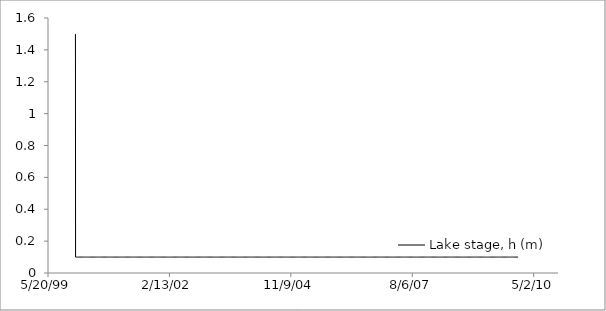
| Category | Lake stage, h (m) |
|---|---|
| 36526.0 | 1.5 |
| 36527.0 | 0.1 |
| 36528.0 | 0.1 |
| 36529.0 | 0.1 |
| 36530.0 | 0.1 |
| 36531.0 | 0.1 |
| 36532.0 | 0.1 |
| 36533.0 | 0.1 |
| 36534.0 | 0.1 |
| 36535.0 | 0.1 |
| 36536.0 | 0.1 |
| 36537.0 | 0.1 |
| 36538.0 | 0.1 |
| 36539.0 | 0.1 |
| 36540.0 | 0.1 |
| 36541.0 | 0.1 |
| 36542.0 | 0.1 |
| 36543.0 | 0.1 |
| 36544.0 | 0.1 |
| 36545.0 | 0.1 |
| 36546.0 | 0.1 |
| 36547.0 | 0.1 |
| 36548.0 | 0.1 |
| 36549.0 | 0.1 |
| 36550.0 | 0.1 |
| 36551.0 | 0.1 |
| 36552.0 | 0.1 |
| 36553.0 | 0.1 |
| 36554.0 | 0.1 |
| 36555.0 | 0.1 |
| 36556.0 | 0.1 |
| 36557.0 | 0.1 |
| 36558.0 | 0.1 |
| 36559.0 | 0.1 |
| 36560.0 | 0.1 |
| 36561.0 | 0.1 |
| 36562.0 | 0.1 |
| 36563.0 | 0.1 |
| 36564.0 | 0.1 |
| 36565.0 | 0.1 |
| 36566.0 | 0.1 |
| 36567.0 | 0.1 |
| 36568.0 | 0.1 |
| 36569.0 | 0.1 |
| 36570.0 | 0.1 |
| 36571.0 | 0.1 |
| 36572.0 | 0.1 |
| 36573.0 | 0.1 |
| 36574.0 | 0.1 |
| 36575.0 | 0.1 |
| 36576.0 | 0.1 |
| 36577.0 | 0.1 |
| 36578.0 | 0.1 |
| 36579.0 | 0.1 |
| 36580.0 | 0.1 |
| 36581.0 | 0.1 |
| 36582.0 | 0.1 |
| 36583.0 | 0.1 |
| 36584.0 | 0.1 |
| 36585.0 | 0.1 |
| 36586.0 | 0.1 |
| 36587.0 | 0.1 |
| 36588.0 | 0.1 |
| 36589.0 | 0.1 |
| 36590.0 | 0.1 |
| 36591.0 | 0.1 |
| 36592.0 | 0.1 |
| 36593.0 | 0.1 |
| 36594.0 | 0.1 |
| 36595.0 | 0.1 |
| 36596.0 | 0.1 |
| 36597.0 | 0.1 |
| 36598.0 | 0.1 |
| 36599.0 | 0.1 |
| 36600.0 | 0.1 |
| 36601.0 | 0.1 |
| 36602.0 | 0.1 |
| 36603.0 | 0.1 |
| 36604.0 | 0.1 |
| 36605.0 | 0.1 |
| 36606.0 | 0.1 |
| 36607.0 | 0.1 |
| 36608.0 | 0.1 |
| 36609.0 | 0.1 |
| 36610.0 | 0.1 |
| 36611.0 | 0.1 |
| 36612.0 | 0.1 |
| 36613.0 | 0.1 |
| 36614.0 | 0.1 |
| 36615.0 | 0.1 |
| 36616.0 | 0.1 |
| 36617.0 | 0.1 |
| 36618.0 | 0.1 |
| 36619.0 | 0.1 |
| 36620.0 | 0.1 |
| 36621.0 | 0.1 |
| 36622.0 | 0.1 |
| 36623.0 | 0.1 |
| 36624.0 | 0.1 |
| 36625.0 | 0.1 |
| 36626.0 | 0.1 |
| 36627.0 | 0.1 |
| 36628.0 | 0.1 |
| 36629.0 | 0.1 |
| 36630.0 | 0.1 |
| 36631.0 | 0.1 |
| 36632.0 | 0.1 |
| 36633.0 | 0.1 |
| 36634.0 | 0.1 |
| 36635.0 | 0.1 |
| 36636.0 | 0.1 |
| 36637.0 | 0.1 |
| 36638.0 | 0.1 |
| 36639.0 | 0.1 |
| 36640.0 | 0.1 |
| 36641.0 | 0.1 |
| 36642.0 | 0.1 |
| 36643.0 | 0.1 |
| 36644.0 | 0.1 |
| 36645.0 | 0.1 |
| 36646.0 | 0.1 |
| 36647.0 | 0.1 |
| 36648.0 | 0.1 |
| 36649.0 | 0.1 |
| 36650.0 | 0.1 |
| 36651.0 | 0.1 |
| 36652.0 | 0.1 |
| 36653.0 | 0.1 |
| 36654.0 | 0.1 |
| 36655.0 | 0.1 |
| 36656.0 | 0.1 |
| 36657.0 | 0.1 |
| 36658.0 | 0.1 |
| 36659.0 | 0.1 |
| 36660.0 | 0.1 |
| 36661.0 | 0.1 |
| 36662.0 | 0.1 |
| 36663.0 | 0.1 |
| 36664.0 | 0.1 |
| 36665.0 | 0.1 |
| 36666.0 | 0.1 |
| 36667.0 | 0.1 |
| 36668.0 | 0.1 |
| 36669.0 | 0.1 |
| 36670.0 | 0.1 |
| 36671.0 | 0.1 |
| 36672.0 | 0.1 |
| 36673.0 | 0.1 |
| 36674.0 | 0.1 |
| 36675.0 | 0.1 |
| 36676.0 | 0.1 |
| 36677.0 | 0.1 |
| 36678.0 | 0.1 |
| 36679.0 | 0.1 |
| 36680.0 | 0.1 |
| 36681.0 | 0.1 |
| 36682.0 | 0.1 |
| 36683.0 | 0.1 |
| 36684.0 | 0.1 |
| 36685.0 | 0.1 |
| 36686.0 | 0.1 |
| 36687.0 | 0.1 |
| 36688.0 | 0.1 |
| 36689.0 | 0.1 |
| 36690.0 | 0.1 |
| 36691.0 | 0.1 |
| 36692.0 | 0.1 |
| 36693.0 | 0.1 |
| 36694.0 | 0.1 |
| 36695.0 | 0.1 |
| 36696.0 | 0.1 |
| 36697.0 | 0.1 |
| 36698.0 | 0.1 |
| 36699.0 | 0.1 |
| 36700.0 | 0.1 |
| 36701.0 | 0.1 |
| 36702.0 | 0.1 |
| 36703.0 | 0.1 |
| 36704.0 | 0.1 |
| 36705.0 | 0.1 |
| 36706.0 | 0.1 |
| 36707.0 | 0.1 |
| 36708.0 | 0.1 |
| 36709.0 | 0.1 |
| 36710.0 | 0.1 |
| 36711.0 | 0.1 |
| 36712.0 | 0.1 |
| 36713.0 | 0.1 |
| 36714.0 | 0.1 |
| 36715.0 | 0.1 |
| 36716.0 | 0.1 |
| 36717.0 | 0.1 |
| 36718.0 | 0.1 |
| 36719.0 | 0.1 |
| 36720.0 | 0.1 |
| 36721.0 | 0.1 |
| 36722.0 | 0.1 |
| 36723.0 | 0.1 |
| 36724.0 | 0.1 |
| 36725.0 | 0.1 |
| 36726.0 | 0.1 |
| 36727.0 | 0.1 |
| 36728.0 | 0.1 |
| 36729.0 | 0.1 |
| 36730.0 | 0.1 |
| 36731.0 | 0.1 |
| 36732.0 | 0.1 |
| 36733.0 | 0.1 |
| 36734.0 | 0.1 |
| 36735.0 | 0.1 |
| 36736.0 | 0.1 |
| 36737.0 | 0.1 |
| 36738.0 | 0.1 |
| 36739.0 | 0.1 |
| 36740.0 | 0.1 |
| 36741.0 | 0.1 |
| 36742.0 | 0.1 |
| 36743.0 | 0.1 |
| 36744.0 | 0.1 |
| 36745.0 | 0.1 |
| 36746.0 | 0.1 |
| 36747.0 | 0.1 |
| 36748.0 | 0.1 |
| 36749.0 | 0.1 |
| 36750.0 | 0.1 |
| 36751.0 | 0.1 |
| 36752.0 | 0.1 |
| 36753.0 | 0.1 |
| 36754.0 | 0.1 |
| 36755.0 | 0.1 |
| 36756.0 | 0.1 |
| 36757.0 | 0.1 |
| 36758.0 | 0.1 |
| 36759.0 | 0.1 |
| 36760.0 | 0.1 |
| 36761.0 | 0.1 |
| 36762.0 | 0.1 |
| 36763.0 | 0.1 |
| 36764.0 | 0.1 |
| 36765.0 | 0.1 |
| 36766.0 | 0.1 |
| 36767.0 | 0.1 |
| 36768.0 | 0.1 |
| 36769.0 | 0.1 |
| 36770.0 | 0.1 |
| 36771.0 | 0.1 |
| 36772.0 | 0.1 |
| 36773.0 | 0.1 |
| 36774.0 | 0.1 |
| 36775.0 | 0.1 |
| 36776.0 | 0.1 |
| 36777.0 | 0.1 |
| 36778.0 | 0.1 |
| 36779.0 | 0.1 |
| 36780.0 | 0.1 |
| 36781.0 | 0.1 |
| 36782.0 | 0.1 |
| 36783.0 | 0.1 |
| 36784.0 | 0.1 |
| 36785.0 | 0.1 |
| 36786.0 | 0.1 |
| 36787.0 | 0.1 |
| 36788.0 | 0.1 |
| 36789.0 | 0.1 |
| 36790.0 | 0.1 |
| 36791.0 | 0.1 |
| 36792.0 | 0.1 |
| 36793.0 | 0.1 |
| 36794.0 | 0.1 |
| 36795.0 | 0.1 |
| 36796.0 | 0.1 |
| 36797.0 | 0.1 |
| 36798.0 | 0.1 |
| 36799.0 | 0.1 |
| 36800.0 | 0.1 |
| 36801.0 | 0.1 |
| 36802.0 | 0.1 |
| 36803.0 | 0.1 |
| 36804.0 | 0.1 |
| 36805.0 | 0.1 |
| 36806.0 | 0.1 |
| 36807.0 | 0.1 |
| 36808.0 | 0.1 |
| 36809.0 | 0.1 |
| 36810.0 | 0.1 |
| 36811.0 | 0.1 |
| 36812.0 | 0.1 |
| 36813.0 | 0.1 |
| 36814.0 | 0.1 |
| 36815.0 | 0.1 |
| 36816.0 | 0.1 |
| 36817.0 | 0.1 |
| 36818.0 | 0.1 |
| 36819.0 | 0.1 |
| 36820.0 | 0.1 |
| 36821.0 | 0.1 |
| 36822.0 | 0.1 |
| 36823.0 | 0.1 |
| 36824.0 | 0.1 |
| 36825.0 | 0.1 |
| 36826.0 | 0.1 |
| 36827.0 | 0.1 |
| 36828.0 | 0.1 |
| 36829.0 | 0.1 |
| 36830.0 | 0.1 |
| 36831.0 | 0.1 |
| 36832.0 | 0.1 |
| 36833.0 | 0.1 |
| 36834.0 | 0.1 |
| 36835.0 | 0.1 |
| 36836.0 | 0.1 |
| 36837.0 | 0.1 |
| 36838.0 | 0.1 |
| 36839.0 | 0.1 |
| 36840.0 | 0.1 |
| 36841.0 | 0.1 |
| 36842.0 | 0.1 |
| 36843.0 | 0.1 |
| 36844.0 | 0.1 |
| 36845.0 | 0.1 |
| 36846.0 | 0.1 |
| 36847.0 | 0.1 |
| 36848.0 | 0.1 |
| 36849.0 | 0.1 |
| 36850.0 | 0.1 |
| 36851.0 | 0.1 |
| 36852.0 | 0.1 |
| 36853.0 | 0.1 |
| 36854.0 | 0.1 |
| 36855.0 | 0.1 |
| 36856.0 | 0.1 |
| 36857.0 | 0.1 |
| 36858.0 | 0.1 |
| 36859.0 | 0.1 |
| 36860.0 | 0.1 |
| 36861.0 | 0.1 |
| 36862.0 | 0.1 |
| 36863.0 | 0.1 |
| 36864.0 | 0.1 |
| 36865.0 | 0.1 |
| 36866.0 | 0.1 |
| 36867.0 | 0.1 |
| 36868.0 | 0.1 |
| 36869.0 | 0.1 |
| 36870.0 | 0.1 |
| 36871.0 | 0.1 |
| 36872.0 | 0.1 |
| 36873.0 | 0.1 |
| 36874.0 | 0.1 |
| 36875.0 | 0.1 |
| 36876.0 | 0.1 |
| 36877.0 | 0.1 |
| 36878.0 | 0.1 |
| 36879.0 | 0.1 |
| 36880.0 | 0.1 |
| 36881.0 | 0.1 |
| 36882.0 | 0.1 |
| 36883.0 | 0.1 |
| 36884.0 | 0.1 |
| 36885.0 | 0.1 |
| 36886.0 | 0.1 |
| 36887.0 | 0.1 |
| 36888.0 | 0.1 |
| 36889.0 | 0.1 |
| 36890.0 | 0.1 |
| 36891.0 | 0.1 |
| 36892.0 | 0.1 |
| 36893.0 | 0.1 |
| 36894.0 | 0.1 |
| 36895.0 | 0.1 |
| 36896.0 | 0.1 |
| 36897.0 | 0.1 |
| 36898.0 | 0.1 |
| 36899.0 | 0.1 |
| 36900.0 | 0.1 |
| 36901.0 | 0.1 |
| 36902.0 | 0.1 |
| 36903.0 | 0.1 |
| 36904.0 | 0.1 |
| 36905.0 | 0.1 |
| 36906.0 | 0.1 |
| 36907.0 | 0.1 |
| 36908.0 | 0.1 |
| 36909.0 | 0.1 |
| 36910.0 | 0.1 |
| 36911.0 | 0.1 |
| 36912.0 | 0.1 |
| 36913.0 | 0.1 |
| 36914.0 | 0.1 |
| 36915.0 | 0.1 |
| 36916.0 | 0.1 |
| 36917.0 | 0.1 |
| 36918.0 | 0.1 |
| 36919.0 | 0.1 |
| 36920.0 | 0.1 |
| 36921.0 | 0.1 |
| 36922.0 | 0.1 |
| 36923.0 | 0.1 |
| 36924.0 | 0.1 |
| 36925.0 | 0.1 |
| 36926.0 | 0.1 |
| 36927.0 | 0.1 |
| 36928.0 | 0.1 |
| 36929.0 | 0.1 |
| 36930.0 | 0.1 |
| 36931.0 | 0.1 |
| 36932.0 | 0.1 |
| 36933.0 | 0.1 |
| 36934.0 | 0.1 |
| 36935.0 | 0.1 |
| 36936.0 | 0.1 |
| 36937.0 | 0.1 |
| 36938.0 | 0.1 |
| 36939.0 | 0.1 |
| 36940.0 | 0.1 |
| 36941.0 | 0.1 |
| 36942.0 | 0.1 |
| 36943.0 | 0.1 |
| 36944.0 | 0.1 |
| 36945.0 | 0.1 |
| 36946.0 | 0.1 |
| 36947.0 | 0.1 |
| 36948.0 | 0.1 |
| 36949.0 | 0.1 |
| 36950.0 | 0.1 |
| 36951.0 | 0.1 |
| 36952.0 | 0.1 |
| 36953.0 | 0.1 |
| 36954.0 | 0.1 |
| 36955.0 | 0.1 |
| 36956.0 | 0.1 |
| 36957.0 | 0.1 |
| 36958.0 | 0.1 |
| 36959.0 | 0.1 |
| 36960.0 | 0.1 |
| 36961.0 | 0.1 |
| 36962.0 | 0.1 |
| 36963.0 | 0.1 |
| 36964.0 | 0.1 |
| 36965.0 | 0.1 |
| 36966.0 | 0.1 |
| 36967.0 | 0.1 |
| 36968.0 | 0.1 |
| 36969.0 | 0.1 |
| 36970.0 | 0.1 |
| 36971.0 | 0.1 |
| 36972.0 | 0.1 |
| 36973.0 | 0.1 |
| 36974.0 | 0.1 |
| 36975.0 | 0.1 |
| 36976.0 | 0.1 |
| 36977.0 | 0.1 |
| 36978.0 | 0.1 |
| 36979.0 | 0.1 |
| 36980.0 | 0.1 |
| 36981.0 | 0.1 |
| 36982.0 | 0.1 |
| 36983.0 | 0.1 |
| 36984.0 | 0.1 |
| 36985.0 | 0.1 |
| 36986.0 | 0.1 |
| 36987.0 | 0.1 |
| 36988.0 | 0.1 |
| 36989.0 | 0.1 |
| 36990.0 | 0.1 |
| 36991.0 | 0.1 |
| 36992.0 | 0.1 |
| 36993.0 | 0.1 |
| 36994.0 | 0.1 |
| 36995.0 | 0.1 |
| 36996.0 | 0.1 |
| 36997.0 | 0.1 |
| 36998.0 | 0.1 |
| 36999.0 | 0.1 |
| 37000.0 | 0.1 |
| 37001.0 | 0.1 |
| 37002.0 | 0.1 |
| 37003.0 | 0.1 |
| 37004.0 | 0.1 |
| 37005.0 | 0.1 |
| 37006.0 | 0.1 |
| 37007.0 | 0.1 |
| 37008.0 | 0.1 |
| 37009.0 | 0.1 |
| 37010.0 | 0.1 |
| 37011.0 | 0.1 |
| 37012.0 | 0.1 |
| 37013.0 | 0.1 |
| 37014.0 | 0.1 |
| 37015.0 | 0.1 |
| 37016.0 | 0.1 |
| 37017.0 | 0.1 |
| 37018.0 | 0.1 |
| 37019.0 | 0.1 |
| 37020.0 | 0.1 |
| 37021.0 | 0.1 |
| 37022.0 | 0.1 |
| 37023.0 | 0.1 |
| 37024.0 | 0.1 |
| 37025.0 | 0.1 |
| 37026.0 | 0.1 |
| 37027.0 | 0.1 |
| 37028.0 | 0.1 |
| 37029.0 | 0.1 |
| 37030.0 | 0.1 |
| 37031.0 | 0.1 |
| 37032.0 | 0.1 |
| 37033.0 | 0.1 |
| 37034.0 | 0.1 |
| 37035.0 | 0.1 |
| 37036.0 | 0.1 |
| 37037.0 | 0.1 |
| 37038.0 | 0.1 |
| 37039.0 | 0.1 |
| 37040.0 | 0.1 |
| 37041.0 | 0.1 |
| 37042.0 | 0.1 |
| 37043.0 | 0.1 |
| 37044.0 | 0.1 |
| 37045.0 | 0.1 |
| 37046.0 | 0.1 |
| 37047.0 | 0.1 |
| 37048.0 | 0.1 |
| 37049.0 | 0.1 |
| 37050.0 | 0.1 |
| 37051.0 | 0.1 |
| 37052.0 | 0.1 |
| 37053.0 | 0.1 |
| 37054.0 | 0.1 |
| 37055.0 | 0.1 |
| 37056.0 | 0.1 |
| 37057.0 | 0.1 |
| 37058.0 | 0.1 |
| 37059.0 | 0.1 |
| 37060.0 | 0.1 |
| 37061.0 | 0.1 |
| 37062.0 | 0.1 |
| 37063.0 | 0.1 |
| 37064.0 | 0.1 |
| 37065.0 | 0.1 |
| 37066.0 | 0.1 |
| 37067.0 | 0.1 |
| 37068.0 | 0.1 |
| 37069.0 | 0.1 |
| 37070.0 | 0.1 |
| 37071.0 | 0.1 |
| 37072.0 | 0.1 |
| 37073.0 | 0.1 |
| 37074.0 | 0.1 |
| 37075.0 | 0.1 |
| 37076.0 | 0.1 |
| 37077.0 | 0.1 |
| 37078.0 | 0.1 |
| 37079.0 | 0.1 |
| 37080.0 | 0.1 |
| 37081.0 | 0.1 |
| 37082.0 | 0.1 |
| 37083.0 | 0.1 |
| 37084.0 | 0.1 |
| 37085.0 | 0.1 |
| 37086.0 | 0.1 |
| 37087.0 | 0.1 |
| 37088.0 | 0.1 |
| 37089.0 | 0.1 |
| 37090.0 | 0.1 |
| 37091.0 | 0.1 |
| 37092.0 | 0.1 |
| 37093.0 | 0.1 |
| 37094.0 | 0.1 |
| 37095.0 | 0.1 |
| 37096.0 | 0.1 |
| 37097.0 | 0.1 |
| 37098.0 | 0.1 |
| 37099.0 | 0.1 |
| 37100.0 | 0.1 |
| 37101.0 | 0.1 |
| 37102.0 | 0.1 |
| 37103.0 | 0.1 |
| 37104.0 | 0.1 |
| 37105.0 | 0.1 |
| 37106.0 | 0.1 |
| 37107.0 | 0.1 |
| 37108.0 | 0.1 |
| 37109.0 | 0.1 |
| 37110.0 | 0.1 |
| 37111.0 | 0.1 |
| 37112.0 | 0.1 |
| 37113.0 | 0.1 |
| 37114.0 | 0.1 |
| 37115.0 | 0.1 |
| 37116.0 | 0.1 |
| 37117.0 | 0.1 |
| 37118.0 | 0.1 |
| 37119.0 | 0.1 |
| 37120.0 | 0.1 |
| 37121.0 | 0.1 |
| 37122.0 | 0.1 |
| 37123.0 | 0.1 |
| 37124.0 | 0.1 |
| 37125.0 | 0.1 |
| 37126.0 | 0.1 |
| 37127.0 | 0.1 |
| 37128.0 | 0.1 |
| 37129.0 | 0.1 |
| 37130.0 | 0.1 |
| 37131.0 | 0.1 |
| 37132.0 | 0.1 |
| 37133.0 | 0.1 |
| 37134.0 | 0.1 |
| 37135.0 | 0.1 |
| 37136.0 | 0.1 |
| 37137.0 | 0.1 |
| 37138.0 | 0.1 |
| 37139.0 | 0.1 |
| 37140.0 | 0.1 |
| 37141.0 | 0.1 |
| 37142.0 | 0.1 |
| 37143.0 | 0.1 |
| 37144.0 | 0.1 |
| 37145.0 | 0.1 |
| 37146.0 | 0.1 |
| 37147.0 | 0.1 |
| 37148.0 | 0.1 |
| 37149.0 | 0.1 |
| 37150.0 | 0.1 |
| 37151.0 | 0.1 |
| 37152.0 | 0.1 |
| 37153.0 | 0.1 |
| 37154.0 | 0.1 |
| 37155.0 | 0.1 |
| 37156.0 | 0.1 |
| 37157.0 | 0.1 |
| 37158.0 | 0.1 |
| 37159.0 | 0.1 |
| 37160.0 | 0.1 |
| 37161.0 | 0.1 |
| 37162.0 | 0.1 |
| 37163.0 | 0.1 |
| 37164.0 | 0.1 |
| 37165.0 | 0.1 |
| 37166.0 | 0.1 |
| 37167.0 | 0.1 |
| 37168.0 | 0.1 |
| 37169.0 | 0.1 |
| 37170.0 | 0.1 |
| 37171.0 | 0.1 |
| 37172.0 | 0.1 |
| 37173.0 | 0.1 |
| 37174.0 | 0.1 |
| 37175.0 | 0.1 |
| 37176.0 | 0.1 |
| 37177.0 | 0.1 |
| 37178.0 | 0.1 |
| 37179.0 | 0.1 |
| 37180.0 | 0.1 |
| 37181.0 | 0.1 |
| 37182.0 | 0.1 |
| 37183.0 | 0.1 |
| 37184.0 | 0.1 |
| 37185.0 | 0.1 |
| 37186.0 | 0.1 |
| 37187.0 | 0.1 |
| 37188.0 | 0.1 |
| 37189.0 | 0.1 |
| 37190.0 | 0.1 |
| 37191.0 | 0.1 |
| 37192.0 | 0.1 |
| 37193.0 | 0.1 |
| 37194.0 | 0.1 |
| 37195.0 | 0.1 |
| 37196.0 | 0.1 |
| 37197.0 | 0.1 |
| 37198.0 | 0.1 |
| 37199.0 | 0.1 |
| 37200.0 | 0.1 |
| 37201.0 | 0.1 |
| 37202.0 | 0.1 |
| 37203.0 | 0.1 |
| 37204.0 | 0.1 |
| 37205.0 | 0.1 |
| 37206.0 | 0.1 |
| 37207.0 | 0.1 |
| 37208.0 | 0.1 |
| 37209.0 | 0.1 |
| 37210.0 | 0.1 |
| 37211.0 | 0.1 |
| 37212.0 | 0.1 |
| 37213.0 | 0.1 |
| 37214.0 | 0.1 |
| 37215.0 | 0.1 |
| 37216.0 | 0.1 |
| 37217.0 | 0.1 |
| 37218.0 | 0.1 |
| 37219.0 | 0.1 |
| 37220.0 | 0.1 |
| 37221.0 | 0.1 |
| 37222.0 | 0.1 |
| 37223.0 | 0.1 |
| 37224.0 | 0.1 |
| 37225.0 | 0.1 |
| 37226.0 | 0.1 |
| 37227.0 | 0.1 |
| 37228.0 | 0.1 |
| 37229.0 | 0.1 |
| 37230.0 | 0.1 |
| 37231.0 | 0.1 |
| 37232.0 | 0.1 |
| 37233.0 | 0.1 |
| 37234.0 | 0.1 |
| 37235.0 | 0.1 |
| 37236.0 | 0.1 |
| 37237.0 | 0.1 |
| 37238.0 | 0.1 |
| 37239.0 | 0.1 |
| 37240.0 | 0.1 |
| 37241.0 | 0.1 |
| 37242.0 | 0.1 |
| 37243.0 | 0.1 |
| 37244.0 | 0.1 |
| 37245.0 | 0.1 |
| 37246.0 | 0.1 |
| 37247.0 | 0.1 |
| 37248.0 | 0.1 |
| 37249.0 | 0.1 |
| 37250.0 | 0.1 |
| 37251.0 | 0.1 |
| 37252.0 | 0.1 |
| 37253.0 | 0.1 |
| 37254.0 | 0.1 |
| 37255.0 | 0.1 |
| 37256.0 | 0.1 |
| 37257.0 | 0.1 |
| 37258.0 | 0.1 |
| 37259.0 | 0.1 |
| 37260.0 | 0.1 |
| 37261.0 | 0.1 |
| 37262.0 | 0.1 |
| 37263.0 | 0.1 |
| 37264.0 | 0.1 |
| 37265.0 | 0.1 |
| 37266.0 | 0.1 |
| 37267.0 | 0.1 |
| 37268.0 | 0.1 |
| 37269.0 | 0.1 |
| 37270.0 | 0.1 |
| 37271.0 | 0.1 |
| 37272.0 | 0.1 |
| 37273.0 | 0.1 |
| 37274.0 | 0.1 |
| 37275.0 | 0.1 |
| 37276.0 | 0.1 |
| 37277.0 | 0.1 |
| 37278.0 | 0.1 |
| 37279.0 | 0.1 |
| 37280.0 | 0.1 |
| 37281.0 | 0.1 |
| 37282.0 | 0.1 |
| 37283.0 | 0.1 |
| 37284.0 | 0.1 |
| 37285.0 | 0.1 |
| 37286.0 | 0.1 |
| 37287.0 | 0.1 |
| 37288.0 | 0.1 |
| 37289.0 | 0.1 |
| 37290.0 | 0.1 |
| 37291.0 | 0.1 |
| 37292.0 | 0.1 |
| 37293.0 | 0.1 |
| 37294.0 | 0.1 |
| 37295.0 | 0.1 |
| 37296.0 | 0.1 |
| 37297.0 | 0.1 |
| 37298.0 | 0.1 |
| 37299.0 | 0.1 |
| 37300.0 | 0.1 |
| 37301.0 | 0.1 |
| 37302.0 | 0.1 |
| 37303.0 | 0.1 |
| 37304.0 | 0.1 |
| 37305.0 | 0.1 |
| 37306.0 | 0.1 |
| 37307.0 | 0.1 |
| 37308.0 | 0.1 |
| 37309.0 | 0.1 |
| 37310.0 | 0.1 |
| 37311.0 | 0.1 |
| 37312.0 | 0.1 |
| 37313.0 | 0.1 |
| 37314.0 | 0.1 |
| 37315.0 | 0.1 |
| 37316.0 | 0.1 |
| 37317.0 | 0.1 |
| 37318.0 | 0.1 |
| 37319.0 | 0.1 |
| 37320.0 | 0.1 |
| 37321.0 | 0.1 |
| 37322.0 | 0.1 |
| 37323.0 | 0.1 |
| 37324.0 | 0.1 |
| 37325.0 | 0.1 |
| 37326.0 | 0.1 |
| 37327.0 | 0.1 |
| 37328.0 | 0.1 |
| 37329.0 | 0.1 |
| 37330.0 | 0.1 |
| 37331.0 | 0.1 |
| 37332.0 | 0.1 |
| 37333.0 | 0.1 |
| 37334.0 | 0.1 |
| 37335.0 | 0.1 |
| 37336.0 | 0.1 |
| 37337.0 | 0.1 |
| 37338.0 | 0.1 |
| 37339.0 | 0.1 |
| 37340.0 | 0.1 |
| 37341.0 | 0.1 |
| 37342.0 | 0.1 |
| 37343.0 | 0.1 |
| 37344.0 | 0.1 |
| 37345.0 | 0.1 |
| 37346.0 | 0.1 |
| 37347.0 | 0.1 |
| 37348.0 | 0.1 |
| 37349.0 | 0.1 |
| 37350.0 | 0.1 |
| 37351.0 | 0.1 |
| 37352.0 | 0.1 |
| 37353.0 | 0.1 |
| 37354.0 | 0.1 |
| 37355.0 | 0.1 |
| 37356.0 | 0.1 |
| 37357.0 | 0.1 |
| 37358.0 | 0.1 |
| 37359.0 | 0.1 |
| 37360.0 | 0.1 |
| 37361.0 | 0.1 |
| 37362.0 | 0.1 |
| 37363.0 | 0.1 |
| 37364.0 | 0.1 |
| 37365.0 | 0.1 |
| 37366.0 | 0.1 |
| 37367.0 | 0.1 |
| 37368.0 | 0.1 |
| 37369.0 | 0.1 |
| 37370.0 | 0.1 |
| 37371.0 | 0.1 |
| 37372.0 | 0.1 |
| 37373.0 | 0.1 |
| 37374.0 | 0.1 |
| 37375.0 | 0.1 |
| 37376.0 | 0.1 |
| 37377.0 | 0.1 |
| 37378.0 | 0.1 |
| 37379.0 | 0.1 |
| 37380.0 | 0.1 |
| 37381.0 | 0.1 |
| 37382.0 | 0.1 |
| 37383.0 | 0.1 |
| 37384.0 | 0.1 |
| 37385.0 | 0.1 |
| 37386.0 | 0.1 |
| 37387.0 | 0.1 |
| 37388.0 | 0.1 |
| 37389.0 | 0.1 |
| 37390.0 | 0.1 |
| 37391.0 | 0.1 |
| 37392.0 | 0.1 |
| 37393.0 | 0.1 |
| 37394.0 | 0.1 |
| 37395.0 | 0.1 |
| 37396.0 | 0.1 |
| 37397.0 | 0.1 |
| 37398.0 | 0.1 |
| 37399.0 | 0.1 |
| 37400.0 | 0.1 |
| 37401.0 | 0.1 |
| 37402.0 | 0.1 |
| 37403.0 | 0.1 |
| 37404.0 | 0.1 |
| 37405.0 | 0.1 |
| 37406.0 | 0.1 |
| 37407.0 | 0.1 |
| 37408.0 | 0.1 |
| 37409.0 | 0.1 |
| 37410.0 | 0.1 |
| 37411.0 | 0.1 |
| 37412.0 | 0.1 |
| 37413.0 | 0.1 |
| 37414.0 | 0.1 |
| 37415.0 | 0.1 |
| 37416.0 | 0.1 |
| 37417.0 | 0.1 |
| 37418.0 | 0.1 |
| 37419.0 | 0.1 |
| 37420.0 | 0.1 |
| 37421.0 | 0.1 |
| 37422.0 | 0.1 |
| 37423.0 | 0.1 |
| 37424.0 | 0.1 |
| 37425.0 | 0.1 |
| 37426.0 | 0.1 |
| 37427.0 | 0.1 |
| 37428.0 | 0.1 |
| 37429.0 | 0.1 |
| 37430.0 | 0.1 |
| 37431.0 | 0.1 |
| 37432.0 | 0.1 |
| 37433.0 | 0.1 |
| 37434.0 | 0.1 |
| 37435.0 | 0.1 |
| 37436.0 | 0.1 |
| 37437.0 | 0.1 |
| 37438.0 | 0.1 |
| 37439.0 | 0.1 |
| 37440.0 | 0.1 |
| 37441.0 | 0.1 |
| 37442.0 | 0.1 |
| 37443.0 | 0.1 |
| 37444.0 | 0.1 |
| 37445.0 | 0.1 |
| 37446.0 | 0.1 |
| 37447.0 | 0.1 |
| 37448.0 | 0.1 |
| 37449.0 | 0.1 |
| 37450.0 | 0.1 |
| 37451.0 | 0.1 |
| 37452.0 | 0.1 |
| 37453.0 | 0.1 |
| 37454.0 | 0.1 |
| 37455.0 | 0.1 |
| 37456.0 | 0.1 |
| 37457.0 | 0.1 |
| 37458.0 | 0.1 |
| 37459.0 | 0.1 |
| 37460.0 | 0.1 |
| 37461.0 | 0.1 |
| 37462.0 | 0.1 |
| 37463.0 | 0.1 |
| 37464.0 | 0.1 |
| 37465.0 | 0.1 |
| 37466.0 | 0.1 |
| 37467.0 | 0.1 |
| 37468.0 | 0.1 |
| 37469.0 | 0.1 |
| 37470.0 | 0.1 |
| 37471.0 | 0.1 |
| 37472.0 | 0.1 |
| 37473.0 | 0.1 |
| 37474.0 | 0.1 |
| 37475.0 | 0.1 |
| 37476.0 | 0.1 |
| 37477.0 | 0.1 |
| 37478.0 | 0.1 |
| 37479.0 | 0.1 |
| 37480.0 | 0.1 |
| 37481.0 | 0.1 |
| 37482.0 | 0.1 |
| 37483.0 | 0.1 |
| 37484.0 | 0.1 |
| 37485.0 | 0.1 |
| 37486.0 | 0.1 |
| 37487.0 | 0.1 |
| 37488.0 | 0.1 |
| 37489.0 | 0.1 |
| 37490.0 | 0.1 |
| 37491.0 | 0.1 |
| 37492.0 | 0.1 |
| 37493.0 | 0.1 |
| 37494.0 | 0.1 |
| 37495.0 | 0.1 |
| 37496.0 | 0.1 |
| 37497.0 | 0.1 |
| 37498.0 | 0.1 |
| 37499.0 | 0.1 |
| 37500.0 | 0.1 |
| 37501.0 | 0.1 |
| 37502.0 | 0.1 |
| 37503.0 | 0.1 |
| 37504.0 | 0.1 |
| 37505.0 | 0.1 |
| 37506.0 | 0.1 |
| 37507.0 | 0.1 |
| 37508.0 | 0.1 |
| 37509.0 | 0.1 |
| 37510.0 | 0.1 |
| 37511.0 | 0.1 |
| 37512.0 | 0.1 |
| 37513.0 | 0.1 |
| 37514.0 | 0.1 |
| 37515.0 | 0.1 |
| 37516.0 | 0.1 |
| 37517.0 | 0.1 |
| 37518.0 | 0.1 |
| 37519.0 | 0.1 |
| 37520.0 | 0.1 |
| 37521.0 | 0.1 |
| 37522.0 | 0.1 |
| 37523.0 | 0.1 |
| 37524.0 | 0.1 |
| 37525.0 | 0.1 |
| 37526.0 | 0.1 |
| 37527.0 | 0.1 |
| 37528.0 | 0.1 |
| 37529.0 | 0.1 |
| 37530.0 | 0.1 |
| 37531.0 | 0.1 |
| 37532.0 | 0.1 |
| 37533.0 | 0.1 |
| 37534.0 | 0.1 |
| 37535.0 | 0.1 |
| 37536.0 | 0.1 |
| 37537.0 | 0.1 |
| 37538.0 | 0.1 |
| 37539.0 | 0.1 |
| 37540.0 | 0.1 |
| 37541.0 | 0.1 |
| 37542.0 | 0.1 |
| 37543.0 | 0.1 |
| 37544.0 | 0.1 |
| 37545.0 | 0.1 |
| 37546.0 | 0.1 |
| 37547.0 | 0.1 |
| 37548.0 | 0.1 |
| 37549.0 | 0.1 |
| 37550.0 | 0.1 |
| 37551.0 | 0.1 |
| 37552.0 | 0.1 |
| 37553.0 | 0.1 |
| 37554.0 | 0.1 |
| 37555.0 | 0.1 |
| 37556.0 | 0.1 |
| 37557.0 | 0.1 |
| 37558.0 | 0.1 |
| 37559.0 | 0.1 |
| 37560.0 | 0.1 |
| 37561.0 | 0.1 |
| 37562.0 | 0.1 |
| 37563.0 | 0.1 |
| 37564.0 | 0.1 |
| 37565.0 | 0.1 |
| 37566.0 | 0.1 |
| 37567.0 | 0.1 |
| 37568.0 | 0.1 |
| 37569.0 | 0.1 |
| 37570.0 | 0.1 |
| 37571.0 | 0.1 |
| 37572.0 | 0.1 |
| 37573.0 | 0.1 |
| 37574.0 | 0.1 |
| 37575.0 | 0.1 |
| 37576.0 | 0.1 |
| 37577.0 | 0.1 |
| 37578.0 | 0.1 |
| 37579.0 | 0.1 |
| 37580.0 | 0.1 |
| 37581.0 | 0.1 |
| 37582.0 | 0.1 |
| 37583.0 | 0.1 |
| 37584.0 | 0.1 |
| 37585.0 | 0.1 |
| 37586.0 | 0.1 |
| 37587.0 | 0.1 |
| 37588.0 | 0.1 |
| 37589.0 | 0.1 |
| 37590.0 | 0.1 |
| 37591.0 | 0.1 |
| 37592.0 | 0.1 |
| 37593.0 | 0.1 |
| 37594.0 | 0.1 |
| 37595.0 | 0.1 |
| 37596.0 | 0.1 |
| 37597.0 | 0.1 |
| 37598.0 | 0.1 |
| 37599.0 | 0.1 |
| 37600.0 | 0.1 |
| 37601.0 | 0.1 |
| 37602.0 | 0.1 |
| 37603.0 | 0.1 |
| 37604.0 | 0.1 |
| 37605.0 | 0.1 |
| 37606.0 | 0.1 |
| 37607.0 | 0.1 |
| 37608.0 | 0.1 |
| 37609.0 | 0.1 |
| 37610.0 | 0.1 |
| 37611.0 | 0.1 |
| 37612.0 | 0.1 |
| 37613.0 | 0.1 |
| 37614.0 | 0.1 |
| 37615.0 | 0.1 |
| 37616.0 | 0.1 |
| 37617.0 | 0.1 |
| 37618.0 | 0.1 |
| 37619.0 | 0.1 |
| 37620.0 | 0.1 |
| 37621.0 | 0.1 |
| 37622.0 | 0.1 |
| 37623.0 | 0.1 |
| 37624.0 | 0.1 |
| 37625.0 | 0.1 |
| 37626.0 | 0.1 |
| 37627.0 | 0.1 |
| 37628.0 | 0.1 |
| 37629.0 | 0.1 |
| 37630.0 | 0.1 |
| 37631.0 | 0.1 |
| 37632.0 | 0.1 |
| 37633.0 | 0.1 |
| 37634.0 | 0.1 |
| 37635.0 | 0.1 |
| 37636.0 | 0.1 |
| 37637.0 | 0.1 |
| 37638.0 | 0.1 |
| 37639.0 | 0.1 |
| 37640.0 | 0.1 |
| 37641.0 | 0.1 |
| 37642.0 | 0.1 |
| 37643.0 | 0.1 |
| 37644.0 | 0.1 |
| 37645.0 | 0.1 |
| 37646.0 | 0.1 |
| 37647.0 | 0.1 |
| 37648.0 | 0.1 |
| 37649.0 | 0.1 |
| 37650.0 | 0.1 |
| 37651.0 | 0.1 |
| 37652.0 | 0.1 |
| 37653.0 | 0.1 |
| 37654.0 | 0.1 |
| 37655.0 | 0.1 |
| 37656.0 | 0.1 |
| 37657.0 | 0.1 |
| 37658.0 | 0.1 |
| 37659.0 | 0.1 |
| 37660.0 | 0.1 |
| 37661.0 | 0.1 |
| 37662.0 | 0.1 |
| 37663.0 | 0.1 |
| 37664.0 | 0.1 |
| 37665.0 | 0.1 |
| 37666.0 | 0.1 |
| 37667.0 | 0.1 |
| 37668.0 | 0.1 |
| 37669.0 | 0.1 |
| 37670.0 | 0.1 |
| 37671.0 | 0.1 |
| 37672.0 | 0.1 |
| 37673.0 | 0.1 |
| 37674.0 | 0.1 |
| 37675.0 | 0.1 |
| 37676.0 | 0.1 |
| 37677.0 | 0.1 |
| 37678.0 | 0.1 |
| 37679.0 | 0.1 |
| 37680.0 | 0.1 |
| 37681.0 | 0.1 |
| 37682.0 | 0.1 |
| 37683.0 | 0.1 |
| 37684.0 | 0.1 |
| 37685.0 | 0.1 |
| 37686.0 | 0.1 |
| 37687.0 | 0.1 |
| 37688.0 | 0.1 |
| 37689.0 | 0.1 |
| 37690.0 | 0.1 |
| 37691.0 | 0.1 |
| 37692.0 | 0.1 |
| 37693.0 | 0.1 |
| 37694.0 | 0.1 |
| 37695.0 | 0.1 |
| 37696.0 | 0.1 |
| 37697.0 | 0.1 |
| 37698.0 | 0.1 |
| 37699.0 | 0.1 |
| 37700.0 | 0.1 |
| 37701.0 | 0.1 |
| 37702.0 | 0.1 |
| 37703.0 | 0.1 |
| 37704.0 | 0.1 |
| 37705.0 | 0.1 |
| 37706.0 | 0.1 |
| 37707.0 | 0.1 |
| 37708.0 | 0.1 |
| 37709.0 | 0.1 |
| 37710.0 | 0.1 |
| 37711.0 | 0.1 |
| 37712.0 | 0.1 |
| 37713.0 | 0.1 |
| 37714.0 | 0.1 |
| 37715.0 | 0.1 |
| 37716.0 | 0.1 |
| 37717.0 | 0.1 |
| 37718.0 | 0.1 |
| 37719.0 | 0.1 |
| 37720.0 | 0.1 |
| 37721.0 | 0.1 |
| 37722.0 | 0.1 |
| 37723.0 | 0.1 |
| 37724.0 | 0.1 |
| 37725.0 | 0.1 |
| 37726.0 | 0.1 |
| 37727.0 | 0.1 |
| 37728.0 | 0.1 |
| 37729.0 | 0.1 |
| 37730.0 | 0.1 |
| 37731.0 | 0.1 |
| 37732.0 | 0.1 |
| 37733.0 | 0.1 |
| 37734.0 | 0.1 |
| 37735.0 | 0.1 |
| 37736.0 | 0.1 |
| 37737.0 | 0.1 |
| 37738.0 | 0.1 |
| 37739.0 | 0.1 |
| 37740.0 | 0.1 |
| 37741.0 | 0.1 |
| 37742.0 | 0.1 |
| 37743.0 | 0.1 |
| 37744.0 | 0.1 |
| 37745.0 | 0.1 |
| 37746.0 | 0.1 |
| 37747.0 | 0.1 |
| 37748.0 | 0.1 |
| 37749.0 | 0.1 |
| 37750.0 | 0.1 |
| 37751.0 | 0.1 |
| 37752.0 | 0.1 |
| 37753.0 | 0.1 |
| 37754.0 | 0.1 |
| 37755.0 | 0.1 |
| 37756.0 | 0.1 |
| 37757.0 | 0.1 |
| 37758.0 | 0.1 |
| 37759.0 | 0.1 |
| 37760.0 | 0.1 |
| 37761.0 | 0.1 |
| 37762.0 | 0.1 |
| 37763.0 | 0.1 |
| 37764.0 | 0.1 |
| 37765.0 | 0.1 |
| 37766.0 | 0.1 |
| 37767.0 | 0.1 |
| 37768.0 | 0.1 |
| 37769.0 | 0.1 |
| 37770.0 | 0.1 |
| 37771.0 | 0.1 |
| 37772.0 | 0.1 |
| 37773.0 | 0.1 |
| 37774.0 | 0.1 |
| 37775.0 | 0.1 |
| 37776.0 | 0.1 |
| 37777.0 | 0.1 |
| 37778.0 | 0.1 |
| 37779.0 | 0.1 |
| 37780.0 | 0.1 |
| 37781.0 | 0.1 |
| 37782.0 | 0.1 |
| 37783.0 | 0.1 |
| 37784.0 | 0.1 |
| 37785.0 | 0.1 |
| 37786.0 | 0.1 |
| 37787.0 | 0.1 |
| 37788.0 | 0.1 |
| 37789.0 | 0.1 |
| 37790.0 | 0.1 |
| 37791.0 | 0.1 |
| 37792.0 | 0.1 |
| 37793.0 | 0.1 |
| 37794.0 | 0.1 |
| 37795.0 | 0.1 |
| 37796.0 | 0.1 |
| 37797.0 | 0.1 |
| 37798.0 | 0.1 |
| 37799.0 | 0.1 |
| 37800.0 | 0.1 |
| 37801.0 | 0.1 |
| 37802.0 | 0.1 |
| 37803.0 | 0.1 |
| 37804.0 | 0.1 |
| 37805.0 | 0.1 |
| 37806.0 | 0.1 |
| 37807.0 | 0.1 |
| 37808.0 | 0.1 |
| 37809.0 | 0.1 |
| 37810.0 | 0.1 |
| 37811.0 | 0.1 |
| 37812.0 | 0.1 |
| 37813.0 | 0.1 |
| 37814.0 | 0.1 |
| 37815.0 | 0.1 |
| 37816.0 | 0.1 |
| 37817.0 | 0.1 |
| 37818.0 | 0.1 |
| 37819.0 | 0.1 |
| 37820.0 | 0.1 |
| 37821.0 | 0.1 |
| 37822.0 | 0.1 |
| 37823.0 | 0.1 |
| 37824.0 | 0.1 |
| 37825.0 | 0.1 |
| 37826.0 | 0.1 |
| 37827.0 | 0.1 |
| 37828.0 | 0.1 |
| 37829.0 | 0.1 |
| 37830.0 | 0.1 |
| 37831.0 | 0.1 |
| 37832.0 | 0.1 |
| 37833.0 | 0.1 |
| 37834.0 | 0.1 |
| 37835.0 | 0.1 |
| 37836.0 | 0.1 |
| 37837.0 | 0.1 |
| 37838.0 | 0.1 |
| 37839.0 | 0.1 |
| 37840.0 | 0.1 |
| 37841.0 | 0.1 |
| 37842.0 | 0.1 |
| 37843.0 | 0.1 |
| 37844.0 | 0.1 |
| 37845.0 | 0.1 |
| 37846.0 | 0.1 |
| 37847.0 | 0.1 |
| 37848.0 | 0.1 |
| 37849.0 | 0.1 |
| 37850.0 | 0.1 |
| 37851.0 | 0.1 |
| 37852.0 | 0.1 |
| 37853.0 | 0.1 |
| 37854.0 | 0.1 |
| 37855.0 | 0.1 |
| 37856.0 | 0.1 |
| 37857.0 | 0.1 |
| 37858.0 | 0.1 |
| 37859.0 | 0.1 |
| 37860.0 | 0.1 |
| 37861.0 | 0.1 |
| 37862.0 | 0.1 |
| 37863.0 | 0.1 |
| 37864.0 | 0.1 |
| 37865.0 | 0.1 |
| 37866.0 | 0.1 |
| 37867.0 | 0.1 |
| 37868.0 | 0.1 |
| 37869.0 | 0.1 |
| 37870.0 | 0.1 |
| 37871.0 | 0.1 |
| 37872.0 | 0.1 |
| 37873.0 | 0.1 |
| 37874.0 | 0.1 |
| 37875.0 | 0.1 |
| 37876.0 | 0.1 |
| 37877.0 | 0.1 |
| 37878.0 | 0.1 |
| 37879.0 | 0.1 |
| 37880.0 | 0.1 |
| 37881.0 | 0.1 |
| 37882.0 | 0.1 |
| 37883.0 | 0.1 |
| 37884.0 | 0.1 |
| 37885.0 | 0.1 |
| 37886.0 | 0.1 |
| 37887.0 | 0.1 |
| 37888.0 | 0.1 |
| 37889.0 | 0.1 |
| 37890.0 | 0.1 |
| 37891.0 | 0.1 |
| 37892.0 | 0.1 |
| 37893.0 | 0.1 |
| 37894.0 | 0.1 |
| 37895.0 | 0.1 |
| 37896.0 | 0.1 |
| 37897.0 | 0.1 |
| 37898.0 | 0.1 |
| 37899.0 | 0.1 |
| 37900.0 | 0.1 |
| 37901.0 | 0.1 |
| 37902.0 | 0.1 |
| 37903.0 | 0.1 |
| 37904.0 | 0.1 |
| 37905.0 | 0.1 |
| 37906.0 | 0.1 |
| 37907.0 | 0.1 |
| 37908.0 | 0.1 |
| 37909.0 | 0.1 |
| 37910.0 | 0.1 |
| 37911.0 | 0.1 |
| 37912.0 | 0.1 |
| 37913.0 | 0.1 |
| 37914.0 | 0.1 |
| 37915.0 | 0.1 |
| 37916.0 | 0.1 |
| 37917.0 | 0.1 |
| 37918.0 | 0.1 |
| 37919.0 | 0.1 |
| 37920.0 | 0.1 |
| 37921.0 | 0.1 |
| 37922.0 | 0.1 |
| 37923.0 | 0.1 |
| 37924.0 | 0.1 |
| 37925.0 | 0.1 |
| 37926.0 | 0.1 |
| 37927.0 | 0.1 |
| 37928.0 | 0.1 |
| 37929.0 | 0.1 |
| 37930.0 | 0.1 |
| 37931.0 | 0.1 |
| 37932.0 | 0.1 |
| 37933.0 | 0.1 |
| 37934.0 | 0.1 |
| 37935.0 | 0.1 |
| 37936.0 | 0.1 |
| 37937.0 | 0.1 |
| 37938.0 | 0.1 |
| 37939.0 | 0.1 |
| 37940.0 | 0.1 |
| 37941.0 | 0.1 |
| 37942.0 | 0.1 |
| 37943.0 | 0.1 |
| 37944.0 | 0.1 |
| 37945.0 | 0.1 |
| 37946.0 | 0.1 |
| 37947.0 | 0.1 |
| 37948.0 | 0.1 |
| 37949.0 | 0.1 |
| 37950.0 | 0.1 |
| 37951.0 | 0.1 |
| 37952.0 | 0.1 |
| 37953.0 | 0.1 |
| 37954.0 | 0.1 |
| 37955.0 | 0.1 |
| 37956.0 | 0.1 |
| 37957.0 | 0.1 |
| 37958.0 | 0.1 |
| 37959.0 | 0.1 |
| 37960.0 | 0.1 |
| 37961.0 | 0.1 |
| 37962.0 | 0.1 |
| 37963.0 | 0.1 |
| 37964.0 | 0.1 |
| 37965.0 | 0.1 |
| 37966.0 | 0.1 |
| 37967.0 | 0.1 |
| 37968.0 | 0.1 |
| 37969.0 | 0.1 |
| 37970.0 | 0.1 |
| 37971.0 | 0.1 |
| 37972.0 | 0.1 |
| 37973.0 | 0.1 |
| 37974.0 | 0.1 |
| 37975.0 | 0.1 |
| 37976.0 | 0.1 |
| 37977.0 | 0.1 |
| 37978.0 | 0.1 |
| 37979.0 | 0.1 |
| 37980.0 | 0.1 |
| 37981.0 | 0.1 |
| 37982.0 | 0.1 |
| 37983.0 | 0.1 |
| 37984.0 | 0.1 |
| 37985.0 | 0.1 |
| 37986.0 | 0.1 |
| 37987.0 | 0.1 |
| 37988.0 | 0.1 |
| 37989.0 | 0.1 |
| 37990.0 | 0.1 |
| 37991.0 | 0.1 |
| 37992.0 | 0.1 |
| 37993.0 | 0.1 |
| 37994.0 | 0.1 |
| 37995.0 | 0.1 |
| 37996.0 | 0.1 |
| 37997.0 | 0.1 |
| 37998.0 | 0.1 |
| 37999.0 | 0.1 |
| 38000.0 | 0.1 |
| 38001.0 | 0.1 |
| 38002.0 | 0.1 |
| 38003.0 | 0.1 |
| 38004.0 | 0.1 |
| 38005.0 | 0.1 |
| 38006.0 | 0.1 |
| 38007.0 | 0.1 |
| 38008.0 | 0.1 |
| 38009.0 | 0.1 |
| 38010.0 | 0.1 |
| 38011.0 | 0.1 |
| 38012.0 | 0.1 |
| 38013.0 | 0.1 |
| 38014.0 | 0.1 |
| 38015.0 | 0.1 |
| 38016.0 | 0.1 |
| 38017.0 | 0.1 |
| 38018.0 | 0.1 |
| 38019.0 | 0.1 |
| 38020.0 | 0.1 |
| 38021.0 | 0.1 |
| 38022.0 | 0.1 |
| 38023.0 | 0.1 |
| 38024.0 | 0.1 |
| 38025.0 | 0.1 |
| 38026.0 | 0.1 |
| 38027.0 | 0.1 |
| 38028.0 | 0.1 |
| 38029.0 | 0.1 |
| 38030.0 | 0.1 |
| 38031.0 | 0.1 |
| 38032.0 | 0.1 |
| 38033.0 | 0.1 |
| 38034.0 | 0.1 |
| 38035.0 | 0.1 |
| 38036.0 | 0.1 |
| 38037.0 | 0.1 |
| 38038.0 | 0.1 |
| 38039.0 | 0.1 |
| 38040.0 | 0.1 |
| 38041.0 | 0.1 |
| 38042.0 | 0.1 |
| 38043.0 | 0.1 |
| 38044.0 | 0.1 |
| 38045.0 | 0.1 |
| 38046.0 | 0.1 |
| 38047.0 | 0.1 |
| 38048.0 | 0.1 |
| 38049.0 | 0.1 |
| 38050.0 | 0.1 |
| 38051.0 | 0.1 |
| 38052.0 | 0.1 |
| 38053.0 | 0.1 |
| 38054.0 | 0.1 |
| 38055.0 | 0.1 |
| 38056.0 | 0.1 |
| 38057.0 | 0.1 |
| 38058.0 | 0.1 |
| 38059.0 | 0.1 |
| 38060.0 | 0.1 |
| 38061.0 | 0.1 |
| 38062.0 | 0.1 |
| 38063.0 | 0.1 |
| 38064.0 | 0.1 |
| 38065.0 | 0.1 |
| 38066.0 | 0.1 |
| 38067.0 | 0.1 |
| 38068.0 | 0.1 |
| 38069.0 | 0.1 |
| 38070.0 | 0.1 |
| 38071.0 | 0.1 |
| 38072.0 | 0.1 |
| 38073.0 | 0.1 |
| 38074.0 | 0.1 |
| 38075.0 | 0.1 |
| 38076.0 | 0.1 |
| 38077.0 | 0.1 |
| 38078.0 | 0.1 |
| 38079.0 | 0.1 |
| 38080.0 | 0.1 |
| 38081.0 | 0.1 |
| 38082.0 | 0.1 |
| 38083.0 | 0.1 |
| 38084.0 | 0.1 |
| 38085.0 | 0.1 |
| 38086.0 | 0.1 |
| 38087.0 | 0.1 |
| 38088.0 | 0.1 |
| 38089.0 | 0.1 |
| 38090.0 | 0.1 |
| 38091.0 | 0.1 |
| 38092.0 | 0.1 |
| 38093.0 | 0.1 |
| 38094.0 | 0.1 |
| 38095.0 | 0.1 |
| 38096.0 | 0.1 |
| 38097.0 | 0.1 |
| 38098.0 | 0.1 |
| 38099.0 | 0.1 |
| 38100.0 | 0.1 |
| 38101.0 | 0.1 |
| 38102.0 | 0.1 |
| 38103.0 | 0.1 |
| 38104.0 | 0.1 |
| 38105.0 | 0.1 |
| 38106.0 | 0.1 |
| 38107.0 | 0.1 |
| 38108.0 | 0.1 |
| 38109.0 | 0.1 |
| 38110.0 | 0.1 |
| 38111.0 | 0.1 |
| 38112.0 | 0.1 |
| 38113.0 | 0.1 |
| 38114.0 | 0.1 |
| 38115.0 | 0.1 |
| 38116.0 | 0.1 |
| 38117.0 | 0.1 |
| 38118.0 | 0.1 |
| 38119.0 | 0.1 |
| 38120.0 | 0.1 |
| 38121.0 | 0.1 |
| 38122.0 | 0.1 |
| 38123.0 | 0.1 |
| 38124.0 | 0.1 |
| 38125.0 | 0.1 |
| 38126.0 | 0.1 |
| 38127.0 | 0.1 |
| 38128.0 | 0.1 |
| 38129.0 | 0.1 |
| 38130.0 | 0.1 |
| 38131.0 | 0.1 |
| 38132.0 | 0.1 |
| 38133.0 | 0.1 |
| 38134.0 | 0.1 |
| 38135.0 | 0.1 |
| 38136.0 | 0.1 |
| 38137.0 | 0.1 |
| 38138.0 | 0.1 |
| 38139.0 | 0.1 |
| 38140.0 | 0.1 |
| 38141.0 | 0.1 |
| 38142.0 | 0.1 |
| 38143.0 | 0.1 |
| 38144.0 | 0.1 |
| 38145.0 | 0.1 |
| 38146.0 | 0.1 |
| 38147.0 | 0.1 |
| 38148.0 | 0.1 |
| 38149.0 | 0.1 |
| 38150.0 | 0.1 |
| 38151.0 | 0.1 |
| 38152.0 | 0.1 |
| 38153.0 | 0.1 |
| 38154.0 | 0.1 |
| 38155.0 | 0.1 |
| 38156.0 | 0.1 |
| 38157.0 | 0.1 |
| 38158.0 | 0.1 |
| 38159.0 | 0.1 |
| 38160.0 | 0.1 |
| 38161.0 | 0.1 |
| 38162.0 | 0.1 |
| 38163.0 | 0.1 |
| 38164.0 | 0.1 |
| 38165.0 | 0.1 |
| 38166.0 | 0.1 |
| 38167.0 | 0.1 |
| 38168.0 | 0.1 |
| 38169.0 | 0.1 |
| 38170.0 | 0.1 |
| 38171.0 | 0.1 |
| 38172.0 | 0.1 |
| 38173.0 | 0.1 |
| 38174.0 | 0.1 |
| 38175.0 | 0.1 |
| 38176.0 | 0.1 |
| 38177.0 | 0.1 |
| 38178.0 | 0.1 |
| 38179.0 | 0.1 |
| 38180.0 | 0.1 |
| 38181.0 | 0.1 |
| 38182.0 | 0.1 |
| 38183.0 | 0.1 |
| 38184.0 | 0.1 |
| 38185.0 | 0.1 |
| 38186.0 | 0.1 |
| 38187.0 | 0.1 |
| 38188.0 | 0.1 |
| 38189.0 | 0.1 |
| 38190.0 | 0.1 |
| 38191.0 | 0.1 |
| 38192.0 | 0.1 |
| 38193.0 | 0.1 |
| 38194.0 | 0.1 |
| 38195.0 | 0.1 |
| 38196.0 | 0.1 |
| 38197.0 | 0.1 |
| 38198.0 | 0.1 |
| 38199.0 | 0.1 |
| 38200.0 | 0.1 |
| 38201.0 | 0.1 |
| 38202.0 | 0.1 |
| 38203.0 | 0.1 |
| 38204.0 | 0.1 |
| 38205.0 | 0.1 |
| 38206.0 | 0.1 |
| 38207.0 | 0.1 |
| 38208.0 | 0.1 |
| 38209.0 | 0.1 |
| 38210.0 | 0.1 |
| 38211.0 | 0.1 |
| 38212.0 | 0.1 |
| 38213.0 | 0.1 |
| 38214.0 | 0.1 |
| 38215.0 | 0.1 |
| 38216.0 | 0.1 |
| 38217.0 | 0.1 |
| 38218.0 | 0.1 |
| 38219.0 | 0.1 |
| 38220.0 | 0.1 |
| 38221.0 | 0.1 |
| 38222.0 | 0.1 |
| 38223.0 | 0.1 |
| 38224.0 | 0.1 |
| 38225.0 | 0.1 |
| 38226.0 | 0.1 |
| 38227.0 | 0.1 |
| 38228.0 | 0.1 |
| 38229.0 | 0.1 |
| 38230.0 | 0.1 |
| 38231.0 | 0.1 |
| 38232.0 | 0.1 |
| 38233.0 | 0.1 |
| 38234.0 | 0.1 |
| 38235.0 | 0.1 |
| 38236.0 | 0.1 |
| 38237.0 | 0.1 |
| 38238.0 | 0.1 |
| 38239.0 | 0.1 |
| 38240.0 | 0.1 |
| 38241.0 | 0.1 |
| 38242.0 | 0.1 |
| 38243.0 | 0.1 |
| 38244.0 | 0.1 |
| 38245.0 | 0.1 |
| 38246.0 | 0.1 |
| 38247.0 | 0.1 |
| 38248.0 | 0.1 |
| 38249.0 | 0.1 |
| 38250.0 | 0.1 |
| 38251.0 | 0.1 |
| 38252.0 | 0.1 |
| 38253.0 | 0.1 |
| 38254.0 | 0.1 |
| 38255.0 | 0.1 |
| 38256.0 | 0.1 |
| 38257.0 | 0.1 |
| 38258.0 | 0.1 |
| 38259.0 | 0.1 |
| 38260.0 | 0.1 |
| 38261.0 | 0.1 |
| 38262.0 | 0.1 |
| 38263.0 | 0.1 |
| 38264.0 | 0.1 |
| 38265.0 | 0.1 |
| 38266.0 | 0.1 |
| 38267.0 | 0.1 |
| 38268.0 | 0.1 |
| 38269.0 | 0.1 |
| 38270.0 | 0.1 |
| 38271.0 | 0.1 |
| 38272.0 | 0.1 |
| 38273.0 | 0.1 |
| 38274.0 | 0.1 |
| 38275.0 | 0.1 |
| 38276.0 | 0.1 |
| 38277.0 | 0.1 |
| 38278.0 | 0.1 |
| 38279.0 | 0.1 |
| 38280.0 | 0.1 |
| 38281.0 | 0.1 |
| 38282.0 | 0.1 |
| 38283.0 | 0.1 |
| 38284.0 | 0.1 |
| 38285.0 | 0.1 |
| 38286.0 | 0.1 |
| 38287.0 | 0.1 |
| 38288.0 | 0.1 |
| 38289.0 | 0.1 |
| 38290.0 | 0.1 |
| 38291.0 | 0.1 |
| 38292.0 | 0.1 |
| 38293.0 | 0.1 |
| 38294.0 | 0.1 |
| 38295.0 | 0.1 |
| 38296.0 | 0.1 |
| 38297.0 | 0.1 |
| 38298.0 | 0.1 |
| 38299.0 | 0.1 |
| 38300.0 | 0.1 |
| 38301.0 | 0.1 |
| 38302.0 | 0.1 |
| 38303.0 | 0.1 |
| 38304.0 | 0.1 |
| 38305.0 | 0.1 |
| 38306.0 | 0.1 |
| 38307.0 | 0.1 |
| 38308.0 | 0.1 |
| 38309.0 | 0.1 |
| 38310.0 | 0.1 |
| 38311.0 | 0.1 |
| 38312.0 | 0.1 |
| 38313.0 | 0.1 |
| 38314.0 | 0.1 |
| 38315.0 | 0.1 |
| 38316.0 | 0.1 |
| 38317.0 | 0.1 |
| 38318.0 | 0.1 |
| 38319.0 | 0.1 |
| 38320.0 | 0.1 |
| 38321.0 | 0.1 |
| 38322.0 | 0.1 |
| 38323.0 | 0.1 |
| 38324.0 | 0.1 |
| 38325.0 | 0.1 |
| 38326.0 | 0.1 |
| 38327.0 | 0.1 |
| 38328.0 | 0.1 |
| 38329.0 | 0.1 |
| 38330.0 | 0.1 |
| 38331.0 | 0.1 |
| 38332.0 | 0.1 |
| 38333.0 | 0.1 |
| 38334.0 | 0.1 |
| 38335.0 | 0.1 |
| 38336.0 | 0.1 |
| 38337.0 | 0.1 |
| 38338.0 | 0.1 |
| 38339.0 | 0.1 |
| 38340.0 | 0.1 |
| 38341.0 | 0.1 |
| 38342.0 | 0.1 |
| 38343.0 | 0.1 |
| 38344.0 | 0.1 |
| 38345.0 | 0.1 |
| 38346.0 | 0.1 |
| 38347.0 | 0.1 |
| 38348.0 | 0.1 |
| 38349.0 | 0.1 |
| 38350.0 | 0.1 |
| 38351.0 | 0.1 |
| 38352.0 | 0.1 |
| 38353.0 | 0.1 |
| 38354.0 | 0.1 |
| 38355.0 | 0.1 |
| 38356.0 | 0.1 |
| 38357.0 | 0.1 |
| 38358.0 | 0.1 |
| 38359.0 | 0.1 |
| 38360.0 | 0.1 |
| 38361.0 | 0.1 |
| 38362.0 | 0.1 |
| 38363.0 | 0.1 |
| 38364.0 | 0.1 |
| 38365.0 | 0.1 |
| 38366.0 | 0.1 |
| 38367.0 | 0.1 |
| 38368.0 | 0.1 |
| 38369.0 | 0.1 |
| 38370.0 | 0.1 |
| 38371.0 | 0.1 |
| 38372.0 | 0.1 |
| 38373.0 | 0.1 |
| 38374.0 | 0.1 |
| 38375.0 | 0.1 |
| 38376.0 | 0.1 |
| 38377.0 | 0.1 |
| 38378.0 | 0.1 |
| 38379.0 | 0.1 |
| 38380.0 | 0.1 |
| 38381.0 | 0.1 |
| 38382.0 | 0.1 |
| 38383.0 | 0.1 |
| 38384.0 | 0.1 |
| 38385.0 | 0.1 |
| 38386.0 | 0.1 |
| 38387.0 | 0.1 |
| 38388.0 | 0.1 |
| 38389.0 | 0.1 |
| 38390.0 | 0.1 |
| 38391.0 | 0.1 |
| 38392.0 | 0.1 |
| 38393.0 | 0.1 |
| 38394.0 | 0.1 |
| 38395.0 | 0.1 |
| 38396.0 | 0.1 |
| 38397.0 | 0.1 |
| 38398.0 | 0.1 |
| 38399.0 | 0.1 |
| 38400.0 | 0.1 |
| 38401.0 | 0.1 |
| 38402.0 | 0.1 |
| 38403.0 | 0.1 |
| 38404.0 | 0.1 |
| 38405.0 | 0.1 |
| 38406.0 | 0.1 |
| 38407.0 | 0.1 |
| 38408.0 | 0.1 |
| 38409.0 | 0.1 |
| 38410.0 | 0.1 |
| 38411.0 | 0.1 |
| 38412.0 | 0.1 |
| 38413.0 | 0.1 |
| 38414.0 | 0.1 |
| 38415.0 | 0.1 |
| 38416.0 | 0.1 |
| 38417.0 | 0.1 |
| 38418.0 | 0.1 |
| 38419.0 | 0.1 |
| 38420.0 | 0.1 |
| 38421.0 | 0.1 |
| 38422.0 | 0.1 |
| 38423.0 | 0.1 |
| 38424.0 | 0.1 |
| 38425.0 | 0.1 |
| 38426.0 | 0.1 |
| 38427.0 | 0.1 |
| 38428.0 | 0.1 |
| 38429.0 | 0.1 |
| 38430.0 | 0.1 |
| 38431.0 | 0.1 |
| 38432.0 | 0.1 |
| 38433.0 | 0.1 |
| 38434.0 | 0.1 |
| 38435.0 | 0.1 |
| 38436.0 | 0.1 |
| 38437.0 | 0.1 |
| 38438.0 | 0.1 |
| 38439.0 | 0.1 |
| 38440.0 | 0.1 |
| 38441.0 | 0.1 |
| 38442.0 | 0.1 |
| 38443.0 | 0.1 |
| 38444.0 | 0.1 |
| 38445.0 | 0.1 |
| 38446.0 | 0.1 |
| 38447.0 | 0.1 |
| 38448.0 | 0.1 |
| 38449.0 | 0.1 |
| 38450.0 | 0.1 |
| 38451.0 | 0.1 |
| 38452.0 | 0.1 |
| 38453.0 | 0.1 |
| 38454.0 | 0.1 |
| 38455.0 | 0.1 |
| 38456.0 | 0.1 |
| 38457.0 | 0.1 |
| 38458.0 | 0.1 |
| 38459.0 | 0.1 |
| 38460.0 | 0.1 |
| 38461.0 | 0.1 |
| 38462.0 | 0.1 |
| 38463.0 | 0.1 |
| 38464.0 | 0.1 |
| 38465.0 | 0.1 |
| 38466.0 | 0.1 |
| 38467.0 | 0.1 |
| 38468.0 | 0.1 |
| 38469.0 | 0.1 |
| 38470.0 | 0.1 |
| 38471.0 | 0.1 |
| 38472.0 | 0.1 |
| 38473.0 | 0.1 |
| 38474.0 | 0.1 |
| 38475.0 | 0.1 |
| 38476.0 | 0.1 |
| 38477.0 | 0.1 |
| 38478.0 | 0.1 |
| 38479.0 | 0.1 |
| 38480.0 | 0.1 |
| 38481.0 | 0.1 |
| 38482.0 | 0.1 |
| 38483.0 | 0.1 |
| 38484.0 | 0.1 |
| 38485.0 | 0.1 |
| 38486.0 | 0.1 |
| 38487.0 | 0.1 |
| 38488.0 | 0.1 |
| 38489.0 | 0.1 |
| 38490.0 | 0.1 |
| 38491.0 | 0.1 |
| 38492.0 | 0.1 |
| 38493.0 | 0.1 |
| 38494.0 | 0.1 |
| 38495.0 | 0.1 |
| 38496.0 | 0.1 |
| 38497.0 | 0.1 |
| 38498.0 | 0.1 |
| 38499.0 | 0.1 |
| 38500.0 | 0.1 |
| 38501.0 | 0.1 |
| 38502.0 | 0.1 |
| 38503.0 | 0.1 |
| 38504.0 | 0.1 |
| 38505.0 | 0.1 |
| 38506.0 | 0.1 |
| 38507.0 | 0.1 |
| 38508.0 | 0.1 |
| 38509.0 | 0.1 |
| 38510.0 | 0.1 |
| 38511.0 | 0.1 |
| 38512.0 | 0.1 |
| 38513.0 | 0.1 |
| 38514.0 | 0.1 |
| 38515.0 | 0.1 |
| 38516.0 | 0.1 |
| 38517.0 | 0.1 |
| 38518.0 | 0.1 |
| 38519.0 | 0.1 |
| 38520.0 | 0.1 |
| 38521.0 | 0.1 |
| 38522.0 | 0.1 |
| 38523.0 | 0.1 |
| 38524.0 | 0.1 |
| 38525.0 | 0.1 |
| 38526.0 | 0.1 |
| 38527.0 | 0.1 |
| 38528.0 | 0.1 |
| 38529.0 | 0.1 |
| 38530.0 | 0.1 |
| 38531.0 | 0.1 |
| 38532.0 | 0.1 |
| 38533.0 | 0.1 |
| 38534.0 | 0.1 |
| 38535.0 | 0.1 |
| 38536.0 | 0.1 |
| 38537.0 | 0.1 |
| 38538.0 | 0.1 |
| 38539.0 | 0.1 |
| 38540.0 | 0.1 |
| 38541.0 | 0.1 |
| 38542.0 | 0.1 |
| 38543.0 | 0.1 |
| 38544.0 | 0.1 |
| 38545.0 | 0.1 |
| 38546.0 | 0.1 |
| 38547.0 | 0.1 |
| 38548.0 | 0.1 |
| 38549.0 | 0.1 |
| 38550.0 | 0.1 |
| 38551.0 | 0.1 |
| 38552.0 | 0.1 |
| 38553.0 | 0.1 |
| 38554.0 | 0.1 |
| 38555.0 | 0.1 |
| 38556.0 | 0.1 |
| 38557.0 | 0.1 |
| 38558.0 | 0.1 |
| 38559.0 | 0.1 |
| 38560.0 | 0.1 |
| 38561.0 | 0.1 |
| 38562.0 | 0.1 |
| 38563.0 | 0.1 |
| 38564.0 | 0.1 |
| 38565.0 | 0.1 |
| 38566.0 | 0.1 |
| 38567.0 | 0.1 |
| 38568.0 | 0.1 |
| 38569.0 | 0.1 |
| 38570.0 | 0.1 |
| 38571.0 | 0.1 |
| 38572.0 | 0.1 |
| 38573.0 | 0.1 |
| 38574.0 | 0.1 |
| 38575.0 | 0.1 |
| 38576.0 | 0.1 |
| 38577.0 | 0.1 |
| 38578.0 | 0.1 |
| 38579.0 | 0.1 |
| 38580.0 | 0.1 |
| 38581.0 | 0.1 |
| 38582.0 | 0.1 |
| 38583.0 | 0.1 |
| 38584.0 | 0.1 |
| 38585.0 | 0.1 |
| 38586.0 | 0.1 |
| 38587.0 | 0.1 |
| 38588.0 | 0.1 |
| 38589.0 | 0.1 |
| 38590.0 | 0.1 |
| 38591.0 | 0.1 |
| 38592.0 | 0.1 |
| 38593.0 | 0.1 |
| 38594.0 | 0.1 |
| 38595.0 | 0.1 |
| 38596.0 | 0.1 |
| 38597.0 | 0.1 |
| 38598.0 | 0.1 |
| 38599.0 | 0.1 |
| 38600.0 | 0.1 |
| 38601.0 | 0.1 |
| 38602.0 | 0.1 |
| 38603.0 | 0.1 |
| 38604.0 | 0.1 |
| 38605.0 | 0.1 |
| 38606.0 | 0.1 |
| 38607.0 | 0.1 |
| 38608.0 | 0.1 |
| 38609.0 | 0.1 |
| 38610.0 | 0.1 |
| 38611.0 | 0.1 |
| 38612.0 | 0.1 |
| 38613.0 | 0.1 |
| 38614.0 | 0.1 |
| 38615.0 | 0.1 |
| 38616.0 | 0.1 |
| 38617.0 | 0.1 |
| 38618.0 | 0.1 |
| 38619.0 | 0.1 |
| 38620.0 | 0.1 |
| 38621.0 | 0.1 |
| 38622.0 | 0.1 |
| 38623.0 | 0.1 |
| 38624.0 | 0.1 |
| 38625.0 | 0.1 |
| 38626.0 | 0.1 |
| 38627.0 | 0.1 |
| 38628.0 | 0.1 |
| 38629.0 | 0.1 |
| 38630.0 | 0.1 |
| 38631.0 | 0.1 |
| 38632.0 | 0.1 |
| 38633.0 | 0.1 |
| 38634.0 | 0.1 |
| 38635.0 | 0.1 |
| 38636.0 | 0.1 |
| 38637.0 | 0.1 |
| 38638.0 | 0.1 |
| 38639.0 | 0.1 |
| 38640.0 | 0.1 |
| 38641.0 | 0.1 |
| 38642.0 | 0.1 |
| 38643.0 | 0.1 |
| 38644.0 | 0.1 |
| 38645.0 | 0.1 |
| 38646.0 | 0.1 |
| 38647.0 | 0.1 |
| 38648.0 | 0.1 |
| 38649.0 | 0.1 |
| 38650.0 | 0.1 |
| 38651.0 | 0.1 |
| 38652.0 | 0.1 |
| 38653.0 | 0.1 |
| 38654.0 | 0.1 |
| 38655.0 | 0.1 |
| 38656.0 | 0.1 |
| 38657.0 | 0.1 |
| 38658.0 | 0.1 |
| 38659.0 | 0.1 |
| 38660.0 | 0.1 |
| 38661.0 | 0.1 |
| 38662.0 | 0.1 |
| 38663.0 | 0.1 |
| 38664.0 | 0.1 |
| 38665.0 | 0.1 |
| 38666.0 | 0.1 |
| 38667.0 | 0.1 |
| 38668.0 | 0.1 |
| 38669.0 | 0.1 |
| 38670.0 | 0.1 |
| 38671.0 | 0.1 |
| 38672.0 | 0.1 |
| 38673.0 | 0.1 |
| 38674.0 | 0.1 |
| 38675.0 | 0.1 |
| 38676.0 | 0.1 |
| 38677.0 | 0.1 |
| 38678.0 | 0.1 |
| 38679.0 | 0.1 |
| 38680.0 | 0.1 |
| 38681.0 | 0.1 |
| 38682.0 | 0.1 |
| 38683.0 | 0.1 |
| 38684.0 | 0.1 |
| 38685.0 | 0.1 |
| 38686.0 | 0.1 |
| 38687.0 | 0.1 |
| 38688.0 | 0.1 |
| 38689.0 | 0.1 |
| 38690.0 | 0.1 |
| 38691.0 | 0.1 |
| 38692.0 | 0.1 |
| 38693.0 | 0.1 |
| 38694.0 | 0.1 |
| 38695.0 | 0.1 |
| 38696.0 | 0.1 |
| 38697.0 | 0.1 |
| 38698.0 | 0.1 |
| 38699.0 | 0.1 |
| 38700.0 | 0.1 |
| 38701.0 | 0.1 |
| 38702.0 | 0.1 |
| 38703.0 | 0.1 |
| 38704.0 | 0.1 |
| 38705.0 | 0.1 |
| 38706.0 | 0.1 |
| 38707.0 | 0.1 |
| 38708.0 | 0.1 |
| 38709.0 | 0.1 |
| 38710.0 | 0.1 |
| 38711.0 | 0.1 |
| 38712.0 | 0.1 |
| 38713.0 | 0.1 |
| 38714.0 | 0.1 |
| 38715.0 | 0.1 |
| 38716.0 | 0.1 |
| 38717.0 | 0.1 |
| 38718.0 | 0.1 |
| 38719.0 | 0.1 |
| 38720.0 | 0.1 |
| 38721.0 | 0.1 |
| 38722.0 | 0.1 |
| 38723.0 | 0.1 |
| 38724.0 | 0.1 |
| 38725.0 | 0.1 |
| 38726.0 | 0.1 |
| 38727.0 | 0.1 |
| 38728.0 | 0.1 |
| 38729.0 | 0.1 |
| 38730.0 | 0.1 |
| 38731.0 | 0.1 |
| 38732.0 | 0.1 |
| 38733.0 | 0.1 |
| 38734.0 | 0.1 |
| 38735.0 | 0.1 |
| 38736.0 | 0.1 |
| 38737.0 | 0.1 |
| 38738.0 | 0.1 |
| 38739.0 | 0.1 |
| 38740.0 | 0.1 |
| 38741.0 | 0.1 |
| 38742.0 | 0.1 |
| 38743.0 | 0.1 |
| 38744.0 | 0.1 |
| 38745.0 | 0.1 |
| 38746.0 | 0.1 |
| 38747.0 | 0.1 |
| 38748.0 | 0.1 |
| 38749.0 | 0.1 |
| 38750.0 | 0.1 |
| 38751.0 | 0.1 |
| 38752.0 | 0.1 |
| 38753.0 | 0.1 |
| 38754.0 | 0.1 |
| 38755.0 | 0.1 |
| 38756.0 | 0.1 |
| 38757.0 | 0.1 |
| 38758.0 | 0.1 |
| 38759.0 | 0.1 |
| 38760.0 | 0.1 |
| 38761.0 | 0.1 |
| 38762.0 | 0.1 |
| 38763.0 | 0.1 |
| 38764.0 | 0.1 |
| 38765.0 | 0.1 |
| 38766.0 | 0.1 |
| 38767.0 | 0.1 |
| 38768.0 | 0.1 |
| 38769.0 | 0.1 |
| 38770.0 | 0.1 |
| 38771.0 | 0.1 |
| 38772.0 | 0.1 |
| 38773.0 | 0.1 |
| 38774.0 | 0.1 |
| 38775.0 | 0.1 |
| 38776.0 | 0.1 |
| 38777.0 | 0.1 |
| 38778.0 | 0.1 |
| 38779.0 | 0.1 |
| 38780.0 | 0.1 |
| 38781.0 | 0.1 |
| 38782.0 | 0.1 |
| 38783.0 | 0.1 |
| 38784.0 | 0.1 |
| 38785.0 | 0.1 |
| 38786.0 | 0.1 |
| 38787.0 | 0.1 |
| 38788.0 | 0.1 |
| 38789.0 | 0.1 |
| 38790.0 | 0.1 |
| 38791.0 | 0.1 |
| 38792.0 | 0.1 |
| 38793.0 | 0.1 |
| 38794.0 | 0.1 |
| 38795.0 | 0.1 |
| 38796.0 | 0.1 |
| 38797.0 | 0.1 |
| 38798.0 | 0.1 |
| 38799.0 | 0.1 |
| 38800.0 | 0.1 |
| 38801.0 | 0.1 |
| 38802.0 | 0.1 |
| 38803.0 | 0.1 |
| 38804.0 | 0.1 |
| 38805.0 | 0.1 |
| 38806.0 | 0.1 |
| 38807.0 | 0.1 |
| 38808.0 | 0.1 |
| 38809.0 | 0.1 |
| 38810.0 | 0.1 |
| 38811.0 | 0.1 |
| 38812.0 | 0.1 |
| 38813.0 | 0.1 |
| 38814.0 | 0.1 |
| 38815.0 | 0.1 |
| 38816.0 | 0.1 |
| 38817.0 | 0.1 |
| 38818.0 | 0.1 |
| 38819.0 | 0.1 |
| 38820.0 | 0.1 |
| 38821.0 | 0.1 |
| 38822.0 | 0.1 |
| 38823.0 | 0.1 |
| 38824.0 | 0.1 |
| 38825.0 | 0.1 |
| 38826.0 | 0.1 |
| 38827.0 | 0.1 |
| 38828.0 | 0.1 |
| 38829.0 | 0.1 |
| 38830.0 | 0.1 |
| 38831.0 | 0.1 |
| 38832.0 | 0.1 |
| 38833.0 | 0.1 |
| 38834.0 | 0.1 |
| 38835.0 | 0.1 |
| 38836.0 | 0.1 |
| 38837.0 | 0.1 |
| 38838.0 | 0.1 |
| 38839.0 | 0.1 |
| 38840.0 | 0.1 |
| 38841.0 | 0.1 |
| 38842.0 | 0.1 |
| 38843.0 | 0.1 |
| 38844.0 | 0.1 |
| 38845.0 | 0.1 |
| 38846.0 | 0.1 |
| 38847.0 | 0.1 |
| 38848.0 | 0.1 |
| 38849.0 | 0.1 |
| 38850.0 | 0.1 |
| 38851.0 | 0.1 |
| 38852.0 | 0.1 |
| 38853.0 | 0.1 |
| 38854.0 | 0.1 |
| 38855.0 | 0.1 |
| 38856.0 | 0.1 |
| 38857.0 | 0.1 |
| 38858.0 | 0.1 |
| 38859.0 | 0.1 |
| 38860.0 | 0.1 |
| 38861.0 | 0.1 |
| 38862.0 | 0.1 |
| 38863.0 | 0.1 |
| 38864.0 | 0.1 |
| 38865.0 | 0.1 |
| 38866.0 | 0.1 |
| 38867.0 | 0.1 |
| 38868.0 | 0.1 |
| 38869.0 | 0.1 |
| 38870.0 | 0.1 |
| 38871.0 | 0.1 |
| 38872.0 | 0.1 |
| 38873.0 | 0.1 |
| 38874.0 | 0.1 |
| 38875.0 | 0.1 |
| 38876.0 | 0.1 |
| 38877.0 | 0.1 |
| 38878.0 | 0.1 |
| 38879.0 | 0.1 |
| 38880.0 | 0.1 |
| 38881.0 | 0.1 |
| 38882.0 | 0.1 |
| 38883.0 | 0.1 |
| 38884.0 | 0.1 |
| 38885.0 | 0.1 |
| 38886.0 | 0.1 |
| 38887.0 | 0.1 |
| 38888.0 | 0.1 |
| 38889.0 | 0.1 |
| 38890.0 | 0.1 |
| 38891.0 | 0.1 |
| 38892.0 | 0.1 |
| 38893.0 | 0.1 |
| 38894.0 | 0.1 |
| 38895.0 | 0.1 |
| 38896.0 | 0.1 |
| 38897.0 | 0.1 |
| 38898.0 | 0.1 |
| 38899.0 | 0.1 |
| 38900.0 | 0.1 |
| 38901.0 | 0.1 |
| 38902.0 | 0.1 |
| 38903.0 | 0.1 |
| 38904.0 | 0.1 |
| 38905.0 | 0.1 |
| 38906.0 | 0.1 |
| 38907.0 | 0.1 |
| 38908.0 | 0.1 |
| 38909.0 | 0.1 |
| 38910.0 | 0.1 |
| 38911.0 | 0.1 |
| 38912.0 | 0.1 |
| 38913.0 | 0.1 |
| 38914.0 | 0.1 |
| 38915.0 | 0.1 |
| 38916.0 | 0.1 |
| 38917.0 | 0.1 |
| 38918.0 | 0.1 |
| 38919.0 | 0.1 |
| 38920.0 | 0.1 |
| 38921.0 | 0.1 |
| 38922.0 | 0.1 |
| 38923.0 | 0.1 |
| 38924.0 | 0.1 |
| 38925.0 | 0.1 |
| 38926.0 | 0.1 |
| 38927.0 | 0.1 |
| 38928.0 | 0.1 |
| 38929.0 | 0.1 |
| 38930.0 | 0.1 |
| 38931.0 | 0.1 |
| 38932.0 | 0.1 |
| 38933.0 | 0.1 |
| 38934.0 | 0.1 |
| 38935.0 | 0.1 |
| 38936.0 | 0.1 |
| 38937.0 | 0.1 |
| 38938.0 | 0.1 |
| 38939.0 | 0.1 |
| 38940.0 | 0.1 |
| 38941.0 | 0.1 |
| 38942.0 | 0.1 |
| 38943.0 | 0.1 |
| 38944.0 | 0.1 |
| 38945.0 | 0.1 |
| 38946.0 | 0.1 |
| 38947.0 | 0.1 |
| 38948.0 | 0.1 |
| 38949.0 | 0.1 |
| 38950.0 | 0.1 |
| 38951.0 | 0.1 |
| 38952.0 | 0.1 |
| 38953.0 | 0.1 |
| 38954.0 | 0.1 |
| 38955.0 | 0.1 |
| 38956.0 | 0.1 |
| 38957.0 | 0.1 |
| 38958.0 | 0.1 |
| 38959.0 | 0.1 |
| 38960.0 | 0.1 |
| 38961.0 | 0.1 |
| 38962.0 | 0.1 |
| 38963.0 | 0.1 |
| 38964.0 | 0.1 |
| 38965.0 | 0.1 |
| 38966.0 | 0.1 |
| 38967.0 | 0.1 |
| 38968.0 | 0.1 |
| 38969.0 | 0.1 |
| 38970.0 | 0.1 |
| 38971.0 | 0.1 |
| 38972.0 | 0.1 |
| 38973.0 | 0.1 |
| 38974.0 | 0.1 |
| 38975.0 | 0.1 |
| 38976.0 | 0.1 |
| 38977.0 | 0.1 |
| 38978.0 | 0.1 |
| 38979.0 | 0.1 |
| 38980.0 | 0.1 |
| 38981.0 | 0.1 |
| 38982.0 | 0.1 |
| 38983.0 | 0.1 |
| 38984.0 | 0.1 |
| 38985.0 | 0.1 |
| 38986.0 | 0.1 |
| 38987.0 | 0.1 |
| 38988.0 | 0.1 |
| 38989.0 | 0.1 |
| 38990.0 | 0.1 |
| 38991.0 | 0.1 |
| 38992.0 | 0.1 |
| 38993.0 | 0.1 |
| 38994.0 | 0.1 |
| 38995.0 | 0.1 |
| 38996.0 | 0.1 |
| 38997.0 | 0.1 |
| 38998.0 | 0.1 |
| 38999.0 | 0.1 |
| 39000.0 | 0.1 |
| 39001.0 | 0.1 |
| 39002.0 | 0.1 |
| 39003.0 | 0.1 |
| 39004.0 | 0.1 |
| 39005.0 | 0.1 |
| 39006.0 | 0.1 |
| 39007.0 | 0.1 |
| 39008.0 | 0.1 |
| 39009.0 | 0.1 |
| 39010.0 | 0.1 |
| 39011.0 | 0.1 |
| 39012.0 | 0.1 |
| 39013.0 | 0.1 |
| 39014.0 | 0.1 |
| 39015.0 | 0.1 |
| 39016.0 | 0.1 |
| 39017.0 | 0.1 |
| 39018.0 | 0.1 |
| 39019.0 | 0.1 |
| 39020.0 | 0.1 |
| 39021.0 | 0.1 |
| 39022.0 | 0.1 |
| 39023.0 | 0.1 |
| 39024.0 | 0.1 |
| 39025.0 | 0.1 |
| 39026.0 | 0.1 |
| 39027.0 | 0.1 |
| 39028.0 | 0.1 |
| 39029.0 | 0.1 |
| 39030.0 | 0.1 |
| 39031.0 | 0.1 |
| 39032.0 | 0.1 |
| 39033.0 | 0.1 |
| 39034.0 | 0.1 |
| 39035.0 | 0.1 |
| 39036.0 | 0.1 |
| 39037.0 | 0.1 |
| 39038.0 | 0.1 |
| 39039.0 | 0.1 |
| 39040.0 | 0.1 |
| 39041.0 | 0.1 |
| 39042.0 | 0.1 |
| 39043.0 | 0.1 |
| 39044.0 | 0.1 |
| 39045.0 | 0.1 |
| 39046.0 | 0.1 |
| 39047.0 | 0.1 |
| 39048.0 | 0.1 |
| 39049.0 | 0.1 |
| 39050.0 | 0.1 |
| 39051.0 | 0.1 |
| 39052.0 | 0.1 |
| 39053.0 | 0.1 |
| 39054.0 | 0.1 |
| 39055.0 | 0.1 |
| 39056.0 | 0.1 |
| 39057.0 | 0.1 |
| 39058.0 | 0.1 |
| 39059.0 | 0.1 |
| 39060.0 | 0.1 |
| 39061.0 | 0.1 |
| 39062.0 | 0.1 |
| 39063.0 | 0.1 |
| 39064.0 | 0.1 |
| 39065.0 | 0.1 |
| 39066.0 | 0.1 |
| 39067.0 | 0.1 |
| 39068.0 | 0.1 |
| 39069.0 | 0.1 |
| 39070.0 | 0.1 |
| 39071.0 | 0.1 |
| 39072.0 | 0.1 |
| 39073.0 | 0.1 |
| 39074.0 | 0.1 |
| 39075.0 | 0.1 |
| 39076.0 | 0.1 |
| 39077.0 | 0.1 |
| 39078.0 | 0.1 |
| 39079.0 | 0.1 |
| 39080.0 | 0.1 |
| 39081.0 | 0.1 |
| 39082.0 | 0.1 |
| 39083.0 | 0.1 |
| 39084.0 | 0.1 |
| 39085.0 | 0.1 |
| 39086.0 | 0.1 |
| 39087.0 | 0.1 |
| 39088.0 | 0.1 |
| 39089.0 | 0.1 |
| 39090.0 | 0.1 |
| 39091.0 | 0.1 |
| 39092.0 | 0.1 |
| 39093.0 | 0.1 |
| 39094.0 | 0.1 |
| 39095.0 | 0.1 |
| 39096.0 | 0.1 |
| 39097.0 | 0.1 |
| 39098.0 | 0.1 |
| 39099.0 | 0.1 |
| 39100.0 | 0.1 |
| 39101.0 | 0.1 |
| 39102.0 | 0.1 |
| 39103.0 | 0.1 |
| 39104.0 | 0.1 |
| 39105.0 | 0.1 |
| 39106.0 | 0.1 |
| 39107.0 | 0.1 |
| 39108.0 | 0.1 |
| 39109.0 | 0.1 |
| 39110.0 | 0.1 |
| 39111.0 | 0.1 |
| 39112.0 | 0.1 |
| 39113.0 | 0.1 |
| 39114.0 | 0.1 |
| 39115.0 | 0.1 |
| 39116.0 | 0.1 |
| 39117.0 | 0.1 |
| 39118.0 | 0.1 |
| 39119.0 | 0.1 |
| 39120.0 | 0.1 |
| 39121.0 | 0.1 |
| 39122.0 | 0.1 |
| 39123.0 | 0.1 |
| 39124.0 | 0.1 |
| 39125.0 | 0.1 |
| 39126.0 | 0.1 |
| 39127.0 | 0.1 |
| 39128.0 | 0.1 |
| 39129.0 | 0.1 |
| 39130.0 | 0.1 |
| 39131.0 | 0.1 |
| 39132.0 | 0.1 |
| 39133.0 | 0.1 |
| 39134.0 | 0.1 |
| 39135.0 | 0.1 |
| 39136.0 | 0.1 |
| 39137.0 | 0.1 |
| 39138.0 | 0.1 |
| 39139.0 | 0.1 |
| 39140.0 | 0.1 |
| 39141.0 | 0.1 |
| 39142.0 | 0.1 |
| 39143.0 | 0.1 |
| 39144.0 | 0.1 |
| 39145.0 | 0.1 |
| 39146.0 | 0.1 |
| 39147.0 | 0.1 |
| 39148.0 | 0.1 |
| 39149.0 | 0.1 |
| 39150.0 | 0.1 |
| 39151.0 | 0.1 |
| 39152.0 | 0.1 |
| 39153.0 | 0.1 |
| 39154.0 | 0.1 |
| 39155.0 | 0.1 |
| 39156.0 | 0.1 |
| 39157.0 | 0.1 |
| 39158.0 | 0.1 |
| 39159.0 | 0.1 |
| 39160.0 | 0.1 |
| 39161.0 | 0.1 |
| 39162.0 | 0.1 |
| 39163.0 | 0.1 |
| 39164.0 | 0.1 |
| 39165.0 | 0.1 |
| 39166.0 | 0.1 |
| 39167.0 | 0.1 |
| 39168.0 | 0.1 |
| 39169.0 | 0.1 |
| 39170.0 | 0.1 |
| 39171.0 | 0.1 |
| 39172.0 | 0.1 |
| 39173.0 | 0.1 |
| 39174.0 | 0.1 |
| 39175.0 | 0.1 |
| 39176.0 | 0.1 |
| 39177.0 | 0.1 |
| 39178.0 | 0.1 |
| 39179.0 | 0.1 |
| 39180.0 | 0.1 |
| 39181.0 | 0.1 |
| 39182.0 | 0.1 |
| 39183.0 | 0.1 |
| 39184.0 | 0.1 |
| 39185.0 | 0.1 |
| 39186.0 | 0.1 |
| 39187.0 | 0.1 |
| 39188.0 | 0.1 |
| 39189.0 | 0.1 |
| 39190.0 | 0.1 |
| 39191.0 | 0.1 |
| 39192.0 | 0.1 |
| 39193.0 | 0.1 |
| 39194.0 | 0.1 |
| 39195.0 | 0.1 |
| 39196.0 | 0.1 |
| 39197.0 | 0.1 |
| 39198.0 | 0.1 |
| 39199.0 | 0.1 |
| 39200.0 | 0.1 |
| 39201.0 | 0.1 |
| 39202.0 | 0.1 |
| 39203.0 | 0.1 |
| 39204.0 | 0.1 |
| 39205.0 | 0.1 |
| 39206.0 | 0.1 |
| 39207.0 | 0.1 |
| 39208.0 | 0.1 |
| 39209.0 | 0.1 |
| 39210.0 | 0.1 |
| 39211.0 | 0.1 |
| 39212.0 | 0.1 |
| 39213.0 | 0.1 |
| 39214.0 | 0.1 |
| 39215.0 | 0.1 |
| 39216.0 | 0.1 |
| 39217.0 | 0.1 |
| 39218.0 | 0.1 |
| 39219.0 | 0.1 |
| 39220.0 | 0.1 |
| 39221.0 | 0.1 |
| 39222.0 | 0.1 |
| 39223.0 | 0.1 |
| 39224.0 | 0.1 |
| 39225.0 | 0.1 |
| 39226.0 | 0.1 |
| 39227.0 | 0.1 |
| 39228.0 | 0.1 |
| 39229.0 | 0.1 |
| 39230.0 | 0.1 |
| 39231.0 | 0.1 |
| 39232.0 | 0.1 |
| 39233.0 | 0.1 |
| 39234.0 | 0.1 |
| 39235.0 | 0.1 |
| 39236.0 | 0.1 |
| 39237.0 | 0.1 |
| 39238.0 | 0.1 |
| 39239.0 | 0.1 |
| 39240.0 | 0.1 |
| 39241.0 | 0.1 |
| 39242.0 | 0.1 |
| 39243.0 | 0.1 |
| 39244.0 | 0.1 |
| 39245.0 | 0.1 |
| 39246.0 | 0.1 |
| 39247.0 | 0.1 |
| 39248.0 | 0.1 |
| 39249.0 | 0.1 |
| 39250.0 | 0.1 |
| 39251.0 | 0.1 |
| 39252.0 | 0.1 |
| 39253.0 | 0.1 |
| 39254.0 | 0.1 |
| 39255.0 | 0.1 |
| 39256.0 | 0.1 |
| 39257.0 | 0.1 |
| 39258.0 | 0.1 |
| 39259.0 | 0.1 |
| 39260.0 | 0.1 |
| 39261.0 | 0.1 |
| 39262.0 | 0.1 |
| 39263.0 | 0.1 |
| 39264.0 | 0.1 |
| 39265.0 | 0.1 |
| 39266.0 | 0.1 |
| 39267.0 | 0.1 |
| 39268.0 | 0.1 |
| 39269.0 | 0.1 |
| 39270.0 | 0.1 |
| 39271.0 | 0.1 |
| 39272.0 | 0.1 |
| 39273.0 | 0.1 |
| 39274.0 | 0.1 |
| 39275.0 | 0.1 |
| 39276.0 | 0.1 |
| 39277.0 | 0.1 |
| 39278.0 | 0.1 |
| 39279.0 | 0.1 |
| 39280.0 | 0.1 |
| 39281.0 | 0.1 |
| 39282.0 | 0.1 |
| 39283.0 | 0.1 |
| 39284.0 | 0.1 |
| 39285.0 | 0.1 |
| 39286.0 | 0.1 |
| 39287.0 | 0.1 |
| 39288.0 | 0.1 |
| 39289.0 | 0.1 |
| 39290.0 | 0.1 |
| 39291.0 | 0.1 |
| 39292.0 | 0.1 |
| 39293.0 | 0.1 |
| 39294.0 | 0.1 |
| 39295.0 | 0.1 |
| 39296.0 | 0.1 |
| 39297.0 | 0.1 |
| 39298.0 | 0.1 |
| 39299.0 | 0.1 |
| 39300.0 | 0.1 |
| 39301.0 | 0.1 |
| 39302.0 | 0.1 |
| 39303.0 | 0.1 |
| 39304.0 | 0.1 |
| 39305.0 | 0.1 |
| 39306.0 | 0.1 |
| 39307.0 | 0.1 |
| 39308.0 | 0.1 |
| 39309.0 | 0.1 |
| 39310.0 | 0.1 |
| 39311.0 | 0.1 |
| 39312.0 | 0.1 |
| 39313.0 | 0.1 |
| 39314.0 | 0.1 |
| 39315.0 | 0.1 |
| 39316.0 | 0.1 |
| 39317.0 | 0.1 |
| 39318.0 | 0.1 |
| 39319.0 | 0.1 |
| 39320.0 | 0.1 |
| 39321.0 | 0.1 |
| 39322.0 | 0.1 |
| 39323.0 | 0.1 |
| 39324.0 | 0.1 |
| 39325.0 | 0.1 |
| 39326.0 | 0.1 |
| 39327.0 | 0.1 |
| 39328.0 | 0.1 |
| 39329.0 | 0.1 |
| 39330.0 | 0.1 |
| 39331.0 | 0.1 |
| 39332.0 | 0.1 |
| 39333.0 | 0.1 |
| 39334.0 | 0.1 |
| 39335.0 | 0.1 |
| 39336.0 | 0.1 |
| 39337.0 | 0.1 |
| 39338.0 | 0.1 |
| 39339.0 | 0.1 |
| 39340.0 | 0.1 |
| 39341.0 | 0.1 |
| 39342.0 | 0.1 |
| 39343.0 | 0.1 |
| 39344.0 | 0.1 |
| 39345.0 | 0.1 |
| 39346.0 | 0.1 |
| 39347.0 | 0.1 |
| 39348.0 | 0.1 |
| 39349.0 | 0.1 |
| 39350.0 | 0.1 |
| 39351.0 | 0.1 |
| 39352.0 | 0.1 |
| 39353.0 | 0.1 |
| 39354.0 | 0.1 |
| 39355.0 | 0.1 |
| 39356.0 | 0.1 |
| 39357.0 | 0.1 |
| 39358.0 | 0.1 |
| 39359.0 | 0.1 |
| 39360.0 | 0.1 |
| 39361.0 | 0.1 |
| 39362.0 | 0.1 |
| 39363.0 | 0.1 |
| 39364.0 | 0.1 |
| 39365.0 | 0.1 |
| 39366.0 | 0.1 |
| 39367.0 | 0.1 |
| 39368.0 | 0.1 |
| 39369.0 | 0.1 |
| 39370.0 | 0.1 |
| 39371.0 | 0.1 |
| 39372.0 | 0.1 |
| 39373.0 | 0.1 |
| 39374.0 | 0.1 |
| 39375.0 | 0.1 |
| 39376.0 | 0.1 |
| 39377.0 | 0.1 |
| 39378.0 | 0.1 |
| 39379.0 | 0.1 |
| 39380.0 | 0.1 |
| 39381.0 | 0.1 |
| 39382.0 | 0.1 |
| 39383.0 | 0.1 |
| 39384.0 | 0.1 |
| 39385.0 | 0.1 |
| 39386.0 | 0.1 |
| 39387.0 | 0.1 |
| 39388.0 | 0.1 |
| 39389.0 | 0.1 |
| 39390.0 | 0.1 |
| 39391.0 | 0.1 |
| 39392.0 | 0.1 |
| 39393.0 | 0.1 |
| 39394.0 | 0.1 |
| 39395.0 | 0.1 |
| 39396.0 | 0.1 |
| 39397.0 | 0.1 |
| 39398.0 | 0.1 |
| 39399.0 | 0.1 |
| 39400.0 | 0.1 |
| 39401.0 | 0.1 |
| 39402.0 | 0.1 |
| 39403.0 | 0.1 |
| 39404.0 | 0.1 |
| 39405.0 | 0.1 |
| 39406.0 | 0.1 |
| 39407.0 | 0.1 |
| 39408.0 | 0.1 |
| 39409.0 | 0.1 |
| 39410.0 | 0.1 |
| 39411.0 | 0.1 |
| 39412.0 | 0.1 |
| 39413.0 | 0.1 |
| 39414.0 | 0.1 |
| 39415.0 | 0.1 |
| 39416.0 | 0.1 |
| 39417.0 | 0.1 |
| 39418.0 | 0.1 |
| 39419.0 | 0.1 |
| 39420.0 | 0.1 |
| 39421.0 | 0.1 |
| 39422.0 | 0.1 |
| 39423.0 | 0.1 |
| 39424.0 | 0.1 |
| 39425.0 | 0.1 |
| 39426.0 | 0.1 |
| 39427.0 | 0.1 |
| 39428.0 | 0.1 |
| 39429.0 | 0.1 |
| 39430.0 | 0.1 |
| 39431.0 | 0.1 |
| 39432.0 | 0.1 |
| 39433.0 | 0.1 |
| 39434.0 | 0.1 |
| 39435.0 | 0.1 |
| 39436.0 | 0.1 |
| 39437.0 | 0.1 |
| 39438.0 | 0.1 |
| 39439.0 | 0.1 |
| 39440.0 | 0.1 |
| 39441.0 | 0.1 |
| 39442.0 | 0.1 |
| 39443.0 | 0.1 |
| 39444.0 | 0.1 |
| 39445.0 | 0.1 |
| 39446.0 | 0.1 |
| 39447.0 | 0.1 |
| 39448.0 | 0.1 |
| 39449.0 | 0.1 |
| 39450.0 | 0.1 |
| 39451.0 | 0.1 |
| 39452.0 | 0.1 |
| 39453.0 | 0.1 |
| 39454.0 | 0.1 |
| 39455.0 | 0.1 |
| 39456.0 | 0.1 |
| 39457.0 | 0.1 |
| 39458.0 | 0.1 |
| 39459.0 | 0.1 |
| 39460.0 | 0.1 |
| 39461.0 | 0.1 |
| 39462.0 | 0.1 |
| 39463.0 | 0.1 |
| 39464.0 | 0.1 |
| 39465.0 | 0.1 |
| 39466.0 | 0.1 |
| 39467.0 | 0.1 |
| 39468.0 | 0.1 |
| 39469.0 | 0.1 |
| 39470.0 | 0.1 |
| 39471.0 | 0.1 |
| 39472.0 | 0.1 |
| 39473.0 | 0.1 |
| 39474.0 | 0.1 |
| 39475.0 | 0.1 |
| 39476.0 | 0.1 |
| 39477.0 | 0.1 |
| 39478.0 | 0.1 |
| 39479.0 | 0.1 |
| 39480.0 | 0.1 |
| 39481.0 | 0.1 |
| 39482.0 | 0.1 |
| 39483.0 | 0.1 |
| 39484.0 | 0.1 |
| 39485.0 | 0.1 |
| 39486.0 | 0.1 |
| 39487.0 | 0.1 |
| 39488.0 | 0.1 |
| 39489.0 | 0.1 |
| 39490.0 | 0.1 |
| 39491.0 | 0.1 |
| 39492.0 | 0.1 |
| 39493.0 | 0.1 |
| 39494.0 | 0.1 |
| 39495.0 | 0.1 |
| 39496.0 | 0.1 |
| 39497.0 | 0.1 |
| 39498.0 | 0.1 |
| 39499.0 | 0.1 |
| 39500.0 | 0.1 |
| 39501.0 | 0.1 |
| 39502.0 | 0.1 |
| 39503.0 | 0.1 |
| 39504.0 | 0.1 |
| 39505.0 | 0.1 |
| 39506.0 | 0.1 |
| 39507.0 | 0.1 |
| 39508.0 | 0.1 |
| 39509.0 | 0.1 |
| 39510.0 | 0.1 |
| 39511.0 | 0.1 |
| 39512.0 | 0.1 |
| 39513.0 | 0.1 |
| 39514.0 | 0.1 |
| 39515.0 | 0.1 |
| 39516.0 | 0.1 |
| 39517.0 | 0.1 |
| 39518.0 | 0.1 |
| 39519.0 | 0.1 |
| 39520.0 | 0.1 |
| 39521.0 | 0.1 |
| 39522.0 | 0.1 |
| 39523.0 | 0.1 |
| 39524.0 | 0.1 |
| 39525.0 | 0.1 |
| 39526.0 | 0.1 |
| 39527.0 | 0.1 |
| 39528.0 | 0.1 |
| 39529.0 | 0.1 |
| 39530.0 | 0.1 |
| 39531.0 | 0.1 |
| 39532.0 | 0.1 |
| 39533.0 | 0.1 |
| 39534.0 | 0.1 |
| 39535.0 | 0.1 |
| 39536.0 | 0.1 |
| 39537.0 | 0.1 |
| 39538.0 | 0.1 |
| 39539.0 | 0.1 |
| 39540.0 | 0.1 |
| 39541.0 | 0.1 |
| 39542.0 | 0.1 |
| 39543.0 | 0.1 |
| 39544.0 | 0.1 |
| 39545.0 | 0.1 |
| 39546.0 | 0.1 |
| 39547.0 | 0.1 |
| 39548.0 | 0.1 |
| 39549.0 | 0.1 |
| 39550.0 | 0.1 |
| 39551.0 | 0.1 |
| 39552.0 | 0.1 |
| 39553.0 | 0.1 |
| 39554.0 | 0.1 |
| 39555.0 | 0.1 |
| 39556.0 | 0.1 |
| 39557.0 | 0.1 |
| 39558.0 | 0.1 |
| 39559.0 | 0.1 |
| 39560.0 | 0.1 |
| 39561.0 | 0.1 |
| 39562.0 | 0.1 |
| 39563.0 | 0.1 |
| 39564.0 | 0.1 |
| 39565.0 | 0.1 |
| 39566.0 | 0.1 |
| 39567.0 | 0.1 |
| 39568.0 | 0.1 |
| 39569.0 | 0.1 |
| 39570.0 | 0.1 |
| 39571.0 | 0.1 |
| 39572.0 | 0.1 |
| 39573.0 | 0.1 |
| 39574.0 | 0.1 |
| 39575.0 | 0.1 |
| 39576.0 | 0.1 |
| 39577.0 | 0.1 |
| 39578.0 | 0.1 |
| 39579.0 | 0.1 |
| 39580.0 | 0.1 |
| 39581.0 | 0.1 |
| 39582.0 | 0.1 |
| 39583.0 | 0.1 |
| 39584.0 | 0.1 |
| 39585.0 | 0.1 |
| 39586.0 | 0.1 |
| 39587.0 | 0.1 |
| 39588.0 | 0.1 |
| 39589.0 | 0.1 |
| 39590.0 | 0.1 |
| 39591.0 | 0.1 |
| 39592.0 | 0.1 |
| 39593.0 | 0.1 |
| 39594.0 | 0.1 |
| 39595.0 | 0.1 |
| 39596.0 | 0.1 |
| 39597.0 | 0.1 |
| 39598.0 | 0.1 |
| 39599.0 | 0.1 |
| 39600.0 | 0.1 |
| 39601.0 | 0.1 |
| 39602.0 | 0.1 |
| 39603.0 | 0.1 |
| 39604.0 | 0.1 |
| 39605.0 | 0.1 |
| 39606.0 | 0.1 |
| 39607.0 | 0.1 |
| 39608.0 | 0.1 |
| 39609.0 | 0.1 |
| 39610.0 | 0.1 |
| 39611.0 | 0.1 |
| 39612.0 | 0.1 |
| 39613.0 | 0.1 |
| 39614.0 | 0.1 |
| 39615.0 | 0.1 |
| 39616.0 | 0.1 |
| 39617.0 | 0.1 |
| 39618.0 | 0.1 |
| 39619.0 | 0.1 |
| 39620.0 | 0.1 |
| 39621.0 | 0.1 |
| 39622.0 | 0.1 |
| 39623.0 | 0.1 |
| 39624.0 | 0.1 |
| 39625.0 | 0.1 |
| 39626.0 | 0.1 |
| 39627.0 | 0.1 |
| 39628.0 | 0.1 |
| 39629.0 | 0.1 |
| 39630.0 | 0.1 |
| 39631.0 | 0.1 |
| 39632.0 | 0.1 |
| 39633.0 | 0.1 |
| 39634.0 | 0.1 |
| 39635.0 | 0.1 |
| 39636.0 | 0.1 |
| 39637.0 | 0.1 |
| 39638.0 | 0.1 |
| 39639.0 | 0.1 |
| 39640.0 | 0.1 |
| 39641.0 | 0.1 |
| 39642.0 | 0.1 |
| 39643.0 | 0.1 |
| 39644.0 | 0.1 |
| 39645.0 | 0.1 |
| 39646.0 | 0.1 |
| 39647.0 | 0.1 |
| 39648.0 | 0.1 |
| 39649.0 | 0.1 |
| 39650.0 | 0.1 |
| 39651.0 | 0.1 |
| 39652.0 | 0.1 |
| 39653.0 | 0.1 |
| 39654.0 | 0.1 |
| 39655.0 | 0.1 |
| 39656.0 | 0.1 |
| 39657.0 | 0.1 |
| 39658.0 | 0.1 |
| 39659.0 | 0.1 |
| 39660.0 | 0.1 |
| 39661.0 | 0.1 |
| 39662.0 | 0.1 |
| 39663.0 | 0.1 |
| 39664.0 | 0.1 |
| 39665.0 | 0.1 |
| 39666.0 | 0.1 |
| 39667.0 | 0.1 |
| 39668.0 | 0.1 |
| 39669.0 | 0.1 |
| 39670.0 | 0.1 |
| 39671.0 | 0.1 |
| 39672.0 | 0.1 |
| 39673.0 | 0.1 |
| 39674.0 | 0.1 |
| 39675.0 | 0.1 |
| 39676.0 | 0.1 |
| 39677.0 | 0.1 |
| 39678.0 | 0.1 |
| 39679.0 | 0.1 |
| 39680.0 | 0.1 |
| 39681.0 | 0.1 |
| 39682.0 | 0.1 |
| 39683.0 | 0.1 |
| 39684.0 | 0.1 |
| 39685.0 | 0.1 |
| 39686.0 | 0.1 |
| 39687.0 | 0.1 |
| 39688.0 | 0.1 |
| 39689.0 | 0.1 |
| 39690.0 | 0.1 |
| 39691.0 | 0.1 |
| 39692.0 | 0.1 |
| 39693.0 | 0.1 |
| 39694.0 | 0.1 |
| 39695.0 | 0.1 |
| 39696.0 | 0.1 |
| 39697.0 | 0.1 |
| 39698.0 | 0.1 |
| 39699.0 | 0.1 |
| 39700.0 | 0.1 |
| 39701.0 | 0.1 |
| 39702.0 | 0.1 |
| 39703.0 | 0.1 |
| 39704.0 | 0.1 |
| 39705.0 | 0.1 |
| 39706.0 | 0.1 |
| 39707.0 | 0.1 |
| 39708.0 | 0.1 |
| 39709.0 | 0.1 |
| 39710.0 | 0.1 |
| 39711.0 | 0.1 |
| 39712.0 | 0.1 |
| 39713.0 | 0.1 |
| 39714.0 | 0.1 |
| 39715.0 | 0.1 |
| 39716.0 | 0.1 |
| 39717.0 | 0.1 |
| 39718.0 | 0.1 |
| 39719.0 | 0.1 |
| 39720.0 | 0.1 |
| 39721.0 | 0.1 |
| 39722.0 | 0.1 |
| 39723.0 | 0.1 |
| 39724.0 | 0.1 |
| 39725.0 | 0.1 |
| 39726.0 | 0.1 |
| 39727.0 | 0.1 |
| 39728.0 | 0.1 |
| 39729.0 | 0.1 |
| 39730.0 | 0.1 |
| 39731.0 | 0.1 |
| 39732.0 | 0.1 |
| 39733.0 | 0.1 |
| 39734.0 | 0.1 |
| 39735.0 | 0.1 |
| 39736.0 | 0.1 |
| 39737.0 | 0.1 |
| 39738.0 | 0.1 |
| 39739.0 | 0.1 |
| 39740.0 | 0.1 |
| 39741.0 | 0.1 |
| 39742.0 | 0.1 |
| 39743.0 | 0.1 |
| 39744.0 | 0.1 |
| 39745.0 | 0.1 |
| 39746.0 | 0.1 |
| 39747.0 | 0.1 |
| 39748.0 | 0.1 |
| 39749.0 | 0.1 |
| 39750.0 | 0.1 |
| 39751.0 | 0.1 |
| 39752.0 | 0.1 |
| 39753.0 | 0.1 |
| 39754.0 | 0.1 |
| 39755.0 | 0.1 |
| 39756.0 | 0.1 |
| 39757.0 | 0.1 |
| 39758.0 | 0.1 |
| 39759.0 | 0.1 |
| 39760.0 | 0.1 |
| 39761.0 | 0.1 |
| 39762.0 | 0.1 |
| 39763.0 | 0.1 |
| 39764.0 | 0.1 |
| 39765.0 | 0.1 |
| 39766.0 | 0.1 |
| 39767.0 | 0.1 |
| 39768.0 | 0.1 |
| 39769.0 | 0.1 |
| 39770.0 | 0.1 |
| 39771.0 | 0.1 |
| 39772.0 | 0.1 |
| 39773.0 | 0.1 |
| 39774.0 | 0.1 |
| 39775.0 | 0.1 |
| 39776.0 | 0.1 |
| 39777.0 | 0.1 |
| 39778.0 | 0.1 |
| 39779.0 | 0.1 |
| 39780.0 | 0.1 |
| 39781.0 | 0.1 |
| 39782.0 | 0.1 |
| 39783.0 | 0.1 |
| 39784.0 | 0.1 |
| 39785.0 | 0.1 |
| 39786.0 | 0.1 |
| 39787.0 | 0.1 |
| 39788.0 | 0.1 |
| 39789.0 | 0.1 |
| 39790.0 | 0.1 |
| 39791.0 | 0.1 |
| 39792.0 | 0.1 |
| 39793.0 | 0.1 |
| 39794.0 | 0.1 |
| 39795.0 | 0.1 |
| 39796.0 | 0.1 |
| 39797.0 | 0.1 |
| 39798.0 | 0.1 |
| 39799.0 | 0.1 |
| 39800.0 | 0.1 |
| 39801.0 | 0.1 |
| 39802.0 | 0.1 |
| 39803.0 | 0.1 |
| 39804.0 | 0.1 |
| 39805.0 | 0.1 |
| 39806.0 | 0.1 |
| 39807.0 | 0.1 |
| 39808.0 | 0.1 |
| 39809.0 | 0.1 |
| 39810.0 | 0.1 |
| 39811.0 | 0.1 |
| 39812.0 | 0.1 |
| 39813.0 | 0.1 |
| 39814.0 | 0.1 |
| 39815.0 | 0.1 |
| 39816.0 | 0.1 |
| 39817.0 | 0.1 |
| 39818.0 | 0.1 |
| 39819.0 | 0.1 |
| 39820.0 | 0.1 |
| 39821.0 | 0.1 |
| 39822.0 | 0.1 |
| 39823.0 | 0.1 |
| 39824.0 | 0.1 |
| 39825.0 | 0.1 |
| 39826.0 | 0.1 |
| 39827.0 | 0.1 |
| 39828.0 | 0.1 |
| 39829.0 | 0.1 |
| 39830.0 | 0.1 |
| 39831.0 | 0.1 |
| 39832.0 | 0.1 |
| 39833.0 | 0.1 |
| 39834.0 | 0.1 |
| 39835.0 | 0.1 |
| 39836.0 | 0.1 |
| 39837.0 | 0.1 |
| 39838.0 | 0.1 |
| 39839.0 | 0.1 |
| 39840.0 | 0.1 |
| 39841.0 | 0.1 |
| 39842.0 | 0.1 |
| 39843.0 | 0.1 |
| 39844.0 | 0.1 |
| 39845.0 | 0.1 |
| 39846.0 | 0.1 |
| 39847.0 | 0.1 |
| 39848.0 | 0.1 |
| 39849.0 | 0.1 |
| 39850.0 | 0.1 |
| 39851.0 | 0.1 |
| 39852.0 | 0.1 |
| 39853.0 | 0.1 |
| 39854.0 | 0.1 |
| 39855.0 | 0.1 |
| 39856.0 | 0.1 |
| 39857.0 | 0.1 |
| 39858.0 | 0.1 |
| 39859.0 | 0.1 |
| 39860.0 | 0.1 |
| 39861.0 | 0.1 |
| 39862.0 | 0.1 |
| 39863.0 | 0.1 |
| 39864.0 | 0.1 |
| 39865.0 | 0.1 |
| 39866.0 | 0.1 |
| 39867.0 | 0.1 |
| 39868.0 | 0.1 |
| 39869.0 | 0.1 |
| 39870.0 | 0.1 |
| 39871.0 | 0.1 |
| 39872.0 | 0.1 |
| 39873.0 | 0.1 |
| 39874.0 | 0.1 |
| 39875.0 | 0.1 |
| 39876.0 | 0.1 |
| 39877.0 | 0.1 |
| 39878.0 | 0.1 |
| 39879.0 | 0.1 |
| 39880.0 | 0.1 |
| 39881.0 | 0.1 |
| 39882.0 | 0.1 |
| 39883.0 | 0.1 |
| 39884.0 | 0.1 |
| 39885.0 | 0.1 |
| 39886.0 | 0.1 |
| 39887.0 | 0.1 |
| 39888.0 | 0.1 |
| 39889.0 | 0.1 |
| 39890.0 | 0.1 |
| 39891.0 | 0.1 |
| 39892.0 | 0.1 |
| 39893.0 | 0.1 |
| 39894.0 | 0.1 |
| 39895.0 | 0.1 |
| 39896.0 | 0.1 |
| 39897.0 | 0.1 |
| 39898.0 | 0.1 |
| 39899.0 | 0.1 |
| 39900.0 | 0.1 |
| 39901.0 | 0.1 |
| 39902.0 | 0.1 |
| 39903.0 | 0.1 |
| 39904.0 | 0.1 |
| 39905.0 | 0.1 |
| 39906.0 | 0.1 |
| 39907.0 | 0.1 |
| 39908.0 | 0.1 |
| 39909.0 | 0.1 |
| 39910.0 | 0.1 |
| 39911.0 | 0.1 |
| 39912.0 | 0.1 |
| 39913.0 | 0.1 |
| 39914.0 | 0.1 |
| 39915.0 | 0.1 |
| 39916.0 | 0.1 |
| 39917.0 | 0.1 |
| 39918.0 | 0.1 |
| 39919.0 | 0.1 |
| 39920.0 | 0.1 |
| 39921.0 | 0.1 |
| 39922.0 | 0.1 |
| 39923.0 | 0.1 |
| 39924.0 | 0.1 |
| 39925.0 | 0.1 |
| 39926.0 | 0.1 |
| 39927.0 | 0.1 |
| 39928.0 | 0.1 |
| 39929.0 | 0.1 |
| 39930.0 | 0.1 |
| 39931.0 | 0.1 |
| 39932.0 | 0.1 |
| 39933.0 | 0.1 |
| 39934.0 | 0.1 |
| 39935.0 | 0.1 |
| 39936.0 | 0.1 |
| 39937.0 | 0.1 |
| 39938.0 | 0.1 |
| 39939.0 | 0.1 |
| 39940.0 | 0.1 |
| 39941.0 | 0.1 |
| 39942.0 | 0.1 |
| 39943.0 | 0.1 |
| 39944.0 | 0.1 |
| 39945.0 | 0.1 |
| 39946.0 | 0.1 |
| 39947.0 | 0.1 |
| 39948.0 | 0.1 |
| 39949.0 | 0.1 |
| 39950.0 | 0.1 |
| 39951.0 | 0.1 |
| 39952.0 | 0.1 |
| 39953.0 | 0.1 |
| 39954.0 | 0.1 |
| 39955.0 | 0.1 |
| 39956.0 | 0.1 |
| 39957.0 | 0.1 |
| 39958.0 | 0.1 |
| 39959.0 | 0.1 |
| 39960.0 | 0.1 |
| 39961.0 | 0.1 |
| 39962.0 | 0.1 |
| 39963.0 | 0.1 |
| 39964.0 | 0.1 |
| 39965.0 | 0.1 |
| 39966.0 | 0.1 |
| 39967.0 | 0.1 |
| 39968.0 | 0.1 |
| 39969.0 | 0.1 |
| 39970.0 | 0.1 |
| 39971.0 | 0.1 |
| 39972.0 | 0.1 |
| 39973.0 | 0.1 |
| 39974.0 | 0.1 |
| 39975.0 | 0.1 |
| 39976.0 | 0.1 |
| 39977.0 | 0.1 |
| 39978.0 | 0.1 |
| 39979.0 | 0.1 |
| 39980.0 | 0.1 |
| 39981.0 | 0.1 |
| 39982.0 | 0.1 |
| 39983.0 | 0.1 |
| 39984.0 | 0.1 |
| 39985.0 | 0.1 |
| 39986.0 | 0.1 |
| 39987.0 | 0.1 |
| 39988.0 | 0.1 |
| 39989.0 | 0.1 |
| 39990.0 | 0.1 |
| 39991.0 | 0.1 |
| 39992.0 | 0.1 |
| 39993.0 | 0.1 |
| 39994.0 | 0.1 |
| 39995.0 | 0.1 |
| 39996.0 | 0.1 |
| 39997.0 | 0.1 |
| 39998.0 | 0.1 |
| 39999.0 | 0.1 |
| 40000.0 | 0.1 |
| 40001.0 | 0.1 |
| 40002.0 | 0.1 |
| 40003.0 | 0.1 |
| 40004.0 | 0.1 |
| 40005.0 | 0.1 |
| 40006.0 | 0.1 |
| 40007.0 | 0.1 |
| 40008.0 | 0.1 |
| 40009.0 | 0.1 |
| 40010.0 | 0.1 |
| 40011.0 | 0.1 |
| 40012.0 | 0.1 |
| 40013.0 | 0.1 |
| 40014.0 | 0.1 |
| 40015.0 | 0.1 |
| 40016.0 | 0.1 |
| 40017.0 | 0.1 |
| 40018.0 | 0.1 |
| 40019.0 | 0.1 |
| 40020.0 | 0.1 |
| 40021.0 | 0.1 |
| 40022.0 | 0.1 |
| 40023.0 | 0.1 |
| 40024.0 | 0.1 |
| 40025.0 | 0.1 |
| 40026.0 | 0.1 |
| 40027.0 | 0.1 |
| 40028.0 | 0.1 |
| 40029.0 | 0.1 |
| 40030.0 | 0.1 |
| 40031.0 | 0.1 |
| 40032.0 | 0.1 |
| 40033.0 | 0.1 |
| 40034.0 | 0.1 |
| 40035.0 | 0.1 |
| 40036.0 | 0.1 |
| 40037.0 | 0.1 |
| 40038.0 | 0.1 |
| 40039.0 | 0.1 |
| 40040.0 | 0.1 |
| 40041.0 | 0.1 |
| 40042.0 | 0.1 |
| 40043.0 | 0.1 |
| 40044.0 | 0.1 |
| 40045.0 | 0.1 |
| 40046.0 | 0.1 |
| 40047.0 | 0.1 |
| 40048.0 | 0.1 |
| 40049.0 | 0.1 |
| 40050.0 | 0.1 |
| 40051.0 | 0.1 |
| 40052.0 | 0.1 |
| 40053.0 | 0.1 |
| 40054.0 | 0.1 |
| 40055.0 | 0.1 |
| 40056.0 | 0.1 |
| 40057.0 | 0.1 |
| 40058.0 | 0.1 |
| 40059.0 | 0.1 |
| 40060.0 | 0.1 |
| 40061.0 | 0.1 |
| 40062.0 | 0.1 |
| 40063.0 | 0.1 |
| 40064.0 | 0.1 |
| 40065.0 | 0.1 |
| 40066.0 | 0.1 |
| 40067.0 | 0.1 |
| 40068.0 | 0.1 |
| 40069.0 | 0.1 |
| 40070.0 | 0.1 |
| 40071.0 | 0.1 |
| 40072.0 | 0.1 |
| 40073.0 | 0.1 |
| 40074.0 | 0.1 |
| 40075.0 | 0.1 |
| 40076.0 | 0.1 |
| 40077.0 | 0.1 |
| 40078.0 | 0.1 |
| 40079.0 | 0.1 |
| 40080.0 | 0.1 |
| 40081.0 | 0.1 |
| 40082.0 | 0.1 |
| 40083.0 | 0.1 |
| 40084.0 | 0.1 |
| 40085.0 | 0.1 |
| 40086.0 | 0.1 |
| 40087.0 | 0.1 |
| 40088.0 | 0.1 |
| 40089.0 | 0.1 |
| 40090.0 | 0.1 |
| 40091.0 | 0.1 |
| 40092.0 | 0.1 |
| 40093.0 | 0.1 |
| 40094.0 | 0.1 |
| 40095.0 | 0.1 |
| 40096.0 | 0.1 |
| 40097.0 | 0.1 |
| 40098.0 | 0.1 |
| 40099.0 | 0.1 |
| 40100.0 | 0.1 |
| 40101.0 | 0.1 |
| 40102.0 | 0.1 |
| 40103.0 | 0.1 |
| 40104.0 | 0.1 |
| 40105.0 | 0.1 |
| 40106.0 | 0.1 |
| 40107.0 | 0.1 |
| 40108.0 | 0.1 |
| 40109.0 | 0.1 |
| 40110.0 | 0.1 |
| 40111.0 | 0.1 |
| 40112.0 | 0.1 |
| 40113.0 | 0.1 |
| 40114.0 | 0.1 |
| 40115.0 | 0.1 |
| 40116.0 | 0.1 |
| 40117.0 | 0.1 |
| 40118.0 | 0.1 |
| 40119.0 | 0.1 |
| 40120.0 | 0.1 |
| 40121.0 | 0.1 |
| 40122.0 | 0.1 |
| 40123.0 | 0.1 |
| 40124.0 | 0.1 |
| 40125.0 | 0.1 |
| 40126.0 | 0.1 |
| 40127.0 | 0.1 |
| 40128.0 | 0.1 |
| 40129.0 | 0.1 |
| 40130.0 | 0.1 |
| 40131.0 | 0.1 |
| 40132.0 | 0.1 |
| 40133.0 | 0.1 |
| 40134.0 | 0.1 |
| 40135.0 | 0.1 |
| 40136.0 | 0.1 |
| 40137.0 | 0.1 |
| 40138.0 | 0.1 |
| 40139.0 | 0.1 |
| 40140.0 | 0.1 |
| 40141.0 | 0.1 |
| 40142.0 | 0.1 |
| 40143.0 | 0.1 |
| 40144.0 | 0.1 |
| 40145.0 | 0.1 |
| 40146.0 | 0.1 |
| 40147.0 | 0.1 |
| 40148.0 | 0.1 |
| 40149.0 | 0.1 |
| 40150.0 | 0.1 |
| 40151.0 | 0.1 |
| 40152.0 | 0.1 |
| 40153.0 | 0.1 |
| 40154.0 | 0.1 |
| 40155.0 | 0.1 |
| 40156.0 | 0.1 |
| 40157.0 | 0.1 |
| 40158.0 | 0.1 |
| 40159.0 | 0.1 |
| 40160.0 | 0.1 |
| 40161.0 | 0.1 |
| 40162.0 | 0.1 |
| 40163.0 | 0.1 |
| 40164.0 | 0.1 |
| 40165.0 | 0.1 |
| 40166.0 | 0.1 |
| 40167.0 | 0.1 |
| 40168.0 | 0.1 |
| 40169.0 | 0.1 |
| 40170.0 | 0.1 |
| 40171.0 | 0.1 |
| 40172.0 | 0.1 |
| 40173.0 | 0.1 |
| 40174.0 | 0.1 |
| 40175.0 | 0.1 |
| 40176.0 | 0.1 |
| 40177.0 | 0.1 |
| 40178.0 | 0.1 |